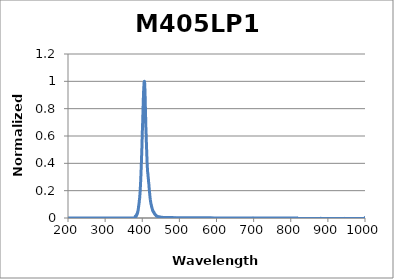
| Category | Normalized Intensity |
|---|---|
| 199.97546 | 0 |
| 200.17692 | 0 |
| 200.37839 | 0 |
| 200.57989 | 0 |
| 200.7814 | 0 |
| 200.98293 | 0 |
| 201.18448 | 0 |
| 201.38605 | 0 |
| 201.58764 | 0 |
| 201.78925 | 0 |
| 201.99087 | 0 |
| 202.19252 | 0 |
| 202.39418 | 0 |
| 202.59586 | 0 |
| 202.79756 | 0 |
| 202.99928 | 0 |
| 203.20102 | 0 |
| 203.40278 | 0 |
| 203.60455 | 0 |
| 203.80635 | 0 |
| 204.00816 | 0 |
| 204.20999 | 0 |
| 204.41184 | 0 |
| 204.61371 | 0 |
| 204.8156 | 0 |
| 205.0175 | 0 |
| 205.21943 | 0 |
| 205.42137 | 0 |
| 205.62334 | 0 |
| 205.82532 | 0 |
| 206.02732 | 0 |
| 206.22934 | 0 |
| 206.43137 | 0 |
| 206.63343 | 0 |
| 206.83551 | 0 |
| 207.0376 | 0 |
| 207.23971 | 0 |
| 207.44184 | 0 |
| 207.64399 | 0 |
| 207.84616 | 0 |
| 208.04835 | 0 |
| 208.25055 | 0 |
| 208.45278 | 0 |
| 208.65502 | 0 |
| 208.85728 | 0 |
| 209.05956 | 0 |
| 209.26186 | 0 |
| 209.46418 | 0 |
| 209.66651 | 0 |
| 209.86887 | 0 |
| 210.07124 | 0 |
| 210.27363 | 0 |
| 210.47604 | 0 |
| 210.67847 | 0 |
| 210.88092 | 0 |
| 211.08338 | 0 |
| 211.28587 | 0 |
| 211.48837 | 0 |
| 211.69089 | 0 |
| 211.89343 | 0 |
| 212.09599 | 0 |
| 212.29857 | 0 |
| 212.50117 | 0 |
| 212.70378 | 0 |
| 212.90641 | 0 |
| 213.10907 | 0 |
| 213.31174 | 0 |
| 213.51442 | 0 |
| 213.71713 | 0 |
| 213.91986 | 0 |
| 214.1226 | 0 |
| 214.32537 | 0 |
| 214.52815 | 0 |
| 214.73095 | 0 |
| 214.93376 | 0 |
| 215.1366 | 0 |
| 215.33946 | 0 |
| 215.54233 | 0 |
| 215.74522 | 0 |
| 215.94813 | 0 |
| 216.15106 | 0 |
| 216.35401 | 0 |
| 216.55698 | 0 |
| 216.75996 | 0 |
| 216.96297 | 0 |
| 217.16599 | 0 |
| 217.36903 | 0 |
| 217.57209 | 0 |
| 217.77517 | 0 |
| 217.97826 | 0 |
| 218.18138 | 0 |
| 218.38451 | 0 |
| 218.58766 | 0 |
| 218.79083 | 0 |
| 218.99402 | 0 |
| 219.19722 | 0 |
| 219.40045 | 0 |
| 219.60369 | 0 |
| 219.80695 | 0 |
| 220.01023 | 0 |
| 220.21353 | 0 |
| 220.41685 | 0 |
| 220.62018 | 0 |
| 220.82354 | 0 |
| 221.02691 | 0 |
| 221.2303 | 0 |
| 221.43371 | 0 |
| 221.63713 | 0 |
| 221.84058 | 0 |
| 222.04404 | 0 |
| 222.24753 | 0 |
| 222.45103 | 0 |
| 222.65455 | 0 |
| 222.85808 | 0 |
| 223.06164 | 0 |
| 223.26521 | 0 |
| 223.46881 | 0 |
| 223.67242 | 0 |
| 223.87605 | 0 |
| 224.07969 | 0 |
| 224.28336 | 0 |
| 224.48704 | 0 |
| 224.69075 | 0 |
| 224.89447 | 0 |
| 225.0982 | 0 |
| 225.30196 | 0 |
| 225.50574 | 0 |
| 225.70953 | 0 |
| 225.91334 | 0 |
| 226.11717 | 0 |
| 226.32102 | 0 |
| 226.52489 | 0 |
| 226.72878 | 0 |
| 226.93268 | 0 |
| 227.1366 | 0 |
| 227.34054 | 0 |
| 227.5445 | 0 |
| 227.74848 | 0 |
| 227.95247 | 0 |
| 228.15649 | 0 |
| 228.36052 | 0 |
| 228.56457 | 0 |
| 228.76863 | 0 |
| 228.97272 | 0 |
| 229.17683 | 0 |
| 229.38095 | 0 |
| 229.58509 | 0 |
| 229.78925 | 0 |
| 229.99343 | 0 |
| 230.19762 | 0 |
| 230.40183 | 0 |
| 230.60607 | 0 |
| 230.81032 | 0 |
| 231.01459 | 0 |
| 231.21887 | 0 |
| 231.42318 | 0 |
| 231.6275 | 0 |
| 231.83184 | 0 |
| 232.0362 | 0 |
| 232.24058 | 0 |
| 232.44497 | 0 |
| 232.64939 | 0 |
| 232.85382 | 0 |
| 233.05827 | 0 |
| 233.26274 | 0 |
| 233.46722 | 0 |
| 233.67173 | 0 |
| 233.87625 | 0 |
| 234.08079 | 0 |
| 234.28535 | 0 |
| 234.48993 | 0 |
| 234.69452 | 0 |
| 234.89914 | 0 |
| 235.10377 | 0 |
| 235.30842 | 0 |
| 235.51309 | 0 |
| 235.71777 | 0 |
| 235.92248 | 0 |
| 236.1272 | 0 |
| 236.33194 | 0 |
| 236.5367 | 0 |
| 236.74147 | 0 |
| 236.94627 | 0 |
| 237.15108 | 0 |
| 237.35591 | 0 |
| 237.56076 | 0 |
| 237.76563 | 0 |
| 237.97051 | 0 |
| 238.17541 | 0 |
| 238.38033 | 0 |
| 238.58527 | 0 |
| 238.79023 | 0 |
| 238.9952 | 0 |
| 239.2002 | 0 |
| 239.40521 | 0 |
| 239.61024 | 0 |
| 239.81529 | 0 |
| 240.02035 | 0 |
| 240.22543 | 0 |
| 240.43053 | 0 |
| 240.63565 | 0 |
| 240.84079 | 0 |
| 241.04595 | 0 |
| 241.25112 | 0 |
| 241.45631 | 0 |
| 241.66152 | 0 |
| 241.86675 | 0 |
| 242.07199 | 0 |
| 242.27726 | 0 |
| 242.48254 | 0 |
| 242.68784 | 0 |
| 242.89315 | 0 |
| 243.09849 | 0 |
| 243.30384 | 0 |
| 243.50921 | 0 |
| 243.7146 | 0 |
| 243.92001 | 0 |
| 244.12543 | 0 |
| 244.33087 | 0 |
| 244.53633 | 0 |
| 244.74181 | 0 |
| 244.94731 | 0 |
| 245.15282 | 0 |
| 245.35836 | 0 |
| 245.56391 | 0 |
| 245.76948 | 0 |
| 245.97506 | 0 |
| 246.18067 | 0 |
| 246.38629 | 0 |
| 246.59193 | 0 |
| 246.79758 | 0 |
| 247.00326 | 0 |
| 247.20895 | 0 |
| 247.41466 | 0 |
| 247.62039 | 0 |
| 247.82614 | 0 |
| 248.03191 | 0 |
| 248.23769 | 0 |
| 248.44349 | 0 |
| 248.64931 | 0 |
| 248.85514 | 0 |
| 249.061 | 0 |
| 249.26687 | 0 |
| 249.47276 | 0 |
| 249.67867 | 0 |
| 249.88459 | 0 |
| 250.09054 | 0 |
| 250.2965 | 0 |
| 250.50248 | 0 |
| 250.70847 | 0 |
| 250.91449 | 0 |
| 251.12052 | 0 |
| 251.32657 | 0 |
| 251.53264 | 0 |
| 251.73872 | 0 |
| 251.94483 | 0 |
| 252.15095 | 0 |
| 252.35709 | 0 |
| 252.56325 | 0 |
| 252.76942 | 0 |
| 252.97561 | 0 |
| 253.18182 | 0 |
| 253.38805 | 0 |
| 253.5943 | 0 |
| 253.80056 | 0 |
| 254.00684 | 0 |
| 254.21314 | 0 |
| 254.41946 | 0 |
| 254.62579 | 0 |
| 254.83214 | 0 |
| 255.03851 | 0 |
| 255.2449 | 0 |
| 255.45131 | 0 |
| 255.65773 | 0 |
| 255.86417 | 0 |
| 256.07063 | 0 |
| 256.27711 | 0 |
| 256.4836 | 0 |
| 256.69011 | 0 |
| 256.89664 | 0 |
| 257.10319 | 0 |
| 257.30975 | 0 |
| 257.51634 | 0 |
| 257.72294 | 0 |
| 257.92955 | 0 |
| 258.13619 | 0 |
| 258.34284 | 0 |
| 258.54951 | 0 |
| 258.7562 | 0 |
| 258.96291 | 0 |
| 259.16963 | 0 |
| 259.37637 | 0 |
| 259.58313 | 0 |
| 259.78991 | 0 |
| 259.9967 | 0 |
| 260.20351 | 0 |
| 260.41034 | 0 |
| 260.61719 | 0 |
| 260.82406 | 0 |
| 261.03094 | 0 |
| 261.23784 | 0 |
| 261.44476 | 0 |
| 261.65169 | 0 |
| 261.85864 | 0 |
| 262.06561 | 0 |
| 262.2726 | 0 |
| 262.47961 | 0 |
| 262.68663 | 0 |
| 262.89367 | 0 |
| 263.10073 | 0 |
| 263.30781 | 0 |
| 263.5149 | 0 |
| 263.72201 | 0 |
| 263.92914 | 0 |
| 264.13629 | 0 |
| 264.34345 | 0 |
| 264.55063 | 0 |
| 264.75783 | 0 |
| 264.96505 | 0 |
| 265.17228 | 0 |
| 265.37953 | 0 |
| 265.5868 | 0 |
| 265.79409 | 0 |
| 266.00139 | 0 |
| 266.20871 | 0 |
| 266.41605 | 0 |
| 266.62341 | 0 |
| 266.83078 | 0 |
| 267.03817 | 0 |
| 267.24558 | 0 |
| 267.45301 | 0 |
| 267.66045 | 0 |
| 267.86791 | 0 |
| 268.07539 | 0 |
| 268.28289 | 0 |
| 268.4904 | 0 |
| 268.69793 | 0 |
| 268.90548 | 0 |
| 269.11305 | 0 |
| 269.32063 | 0 |
| 269.52823 | 0 |
| 269.73585 | 0 |
| 269.94349 | 0 |
| 270.15114 | 0 |
| 270.35881 | 0 |
| 270.5665 | 0 |
| 270.77421 | 0 |
| 270.98193 | 0 |
| 271.18967 | 0 |
| 271.39743 | 0 |
| 271.60521 | 0 |
| 271.813 | 0 |
| 272.02081 | 0 |
| 272.22864 | 0 |
| 272.43648 | 0 |
| 272.64434 | 0 |
| 272.85222 | 0 |
| 273.06012 | 0 |
| 273.26804 | 0 |
| 273.47597 | 0 |
| 273.68392 | 0 |
| 273.89188 | 0 |
| 274.09987 | 0 |
| 274.30787 | 0 |
| 274.51589 | 0 |
| 274.72392 | 0 |
| 274.93198 | 0 |
| 275.14005 | 0 |
| 275.34814 | 0 |
| 275.55624 | 0 |
| 275.76437 | 0 |
| 275.97251 | 0 |
| 276.18066 | 0 |
| 276.38884 | 0 |
| 276.59703 | 0 |
| 276.80524 | 0 |
| 277.01347 | 0 |
| 277.22171 | 0 |
| 277.42997 | 0 |
| 277.63825 | 0 |
| 277.84655 | 0 |
| 278.05486 | 0 |
| 278.26319 | 0 |
| 278.47154 | 0 |
| 278.6799 | 0 |
| 278.88829 | 0 |
| 279.09669 | 0 |
| 279.3051 | 0 |
| 279.51354 | 0 |
| 279.72199 | 0 |
| 279.93046 | 0 |
| 280.13894 | 0 |
| 280.34745 | 0 |
| 280.55597 | 0 |
| 280.7645 | 0 |
| 280.97306 | 0 |
| 281.18163 | 0 |
| 281.39022 | 0 |
| 281.59883 | 0 |
| 281.80745 | 0 |
| 282.01609 | 0 |
| 282.22475 | 0 |
| 282.43342 | 0 |
| 282.64212 | 0 |
| 282.85083 | 0 |
| 283.05955 | 0 |
| 283.2683 | 0 |
| 283.47706 | 0 |
| 283.68584 | 0 |
| 283.89463 | 0 |
| 284.10345 | 0 |
| 284.31228 | 0 |
| 284.52112 | 0 |
| 284.72999 | 0 |
| 284.93887 | 0 |
| 285.14777 | 0 |
| 285.35668 | 0 |
| 285.56562 | 0 |
| 285.77457 | 0 |
| 285.98353 | 0 |
| 286.19252 | 0 |
| 286.40152 | 0 |
| 286.61054 | 0 |
| 286.81957 | 0 |
| 287.02863 | 0 |
| 287.2377 | 0 |
| 287.44678 | 0 |
| 287.65589 | 0 |
| 287.86501 | 0 |
| 288.07415 | 0 |
| 288.2833 | 0 |
| 288.49248 | 0 |
| 288.70167 | 0 |
| 288.91087 | 0 |
| 289.1201 | 0 |
| 289.32934 | 0 |
| 289.53859 | 0 |
| 289.74787 | 0 |
| 289.95716 | 0 |
| 290.16647 | 0 |
| 290.3758 | 0 |
| 290.58514 | 0 |
| 290.7945 | 0 |
| 291.00388 | 0 |
| 291.21327 | 0 |
| 291.42268 | 0 |
| 291.63211 | 0 |
| 291.84156 | 0 |
| 292.05102 | 0 |
| 292.2605 | 0 |
| 292.47 | 0 |
| 292.67951 | 0 |
| 292.88904 | 0 |
| 293.09859 | 0 |
| 293.30815 | 0 |
| 293.51773 | 0 |
| 293.72733 | 0 |
| 293.93695 | 0 |
| 294.14658 | 0 |
| 294.35623 | 0 |
| 294.56589 | 0 |
| 294.77558 | 0 |
| 294.98528 | 0 |
| 295.195 | 0 |
| 295.40473 | 0 |
| 295.61448 | 0 |
| 295.82425 | 0 |
| 296.03403 | 0 |
| 296.24384 | 0 |
| 296.45366 | 0 |
| 296.66349 | 0 |
| 296.87334 | 0 |
| 297.08321 | 0 |
| 297.2931 | 0 |
| 297.503 | 0 |
| 297.71292 | 0 |
| 297.92286 | 0 |
| 298.13282 | 0 |
| 298.34279 | 0 |
| 298.55277 | 0 |
| 298.76278 | 0 |
| 298.9728 | 0 |
| 299.18284 | 0 |
| 299.3929 | 0 |
| 299.60297 | 0 |
| 299.81306 | 0 |
| 300.02316 | 0 |
| 300.23329 | 0 |
| 300.44343 | 0 |
| 300.65358 | 0 |
| 300.86376 | 0 |
| 301.07395 | 0 |
| 301.28416 | 0 |
| 301.49438 | 0 |
| 301.70462 | 0 |
| 301.91488 | 0 |
| 302.12515 | 0 |
| 302.33544 | 0 |
| 302.54575 | 0 |
| 302.75608 | 0 |
| 302.96642 | 0 |
| 303.17678 | 0 |
| 303.38715 | 0 |
| 303.59755 | 0 |
| 303.80796 | 0 |
| 304.01838 | 0 |
| 304.22882 | 0 |
| 304.43928 | 0 |
| 304.64976 | 0 |
| 304.86025 | 0 |
| 305.07076 | 0 |
| 305.28129 | 0 |
| 305.49183 | 0 |
| 305.70239 | 0 |
| 305.91297 | 0 |
| 306.12356 | 0 |
| 306.33417 | 0 |
| 306.5448 | 0 |
| 306.75545 | 0 |
| 306.96611 | 0 |
| 307.17678 | 0 |
| 307.38748 | 0 |
| 307.59819 | 0 |
| 307.80892 | 0 |
| 308.01966 | 0 |
| 308.23042 | 0 |
| 308.4412 | 0 |
| 308.65199 | 0 |
| 308.8628 | 0 |
| 309.07363 | 0 |
| 309.28448 | 0 |
| 309.49534 | 0 |
| 309.70622 | 0 |
| 309.91711 | 0 |
| 310.12802 | 0 |
| 310.33895 | 0 |
| 310.54989 | 0 |
| 310.76085 | 0 |
| 310.97183 | 0 |
| 311.18283 | 0 |
| 311.39384 | 0 |
| 311.60487 | 0 |
| 311.81591 | 0 |
| 312.02697 | 0 |
| 312.23805 | 0 |
| 312.44914 | 0 |
| 312.66025 | 0 |
| 312.87138 | 0 |
| 313.08253 | 0 |
| 313.29369 | 0 |
| 313.50486 | 0 |
| 313.71606 | 0 |
| 313.92727 | 0 |
| 314.1385 | 0 |
| 314.34974 | 0 |
| 314.561 | 0 |
| 314.77228 | 0 |
| 314.98357 | 0 |
| 315.19488 | 0 |
| 315.40621 | 0 |
| 315.61755 | 0 |
| 315.82891 | 0 |
| 316.04029 | 0 |
| 316.25168 | 0 |
| 316.46309 | 0 |
| 316.67452 | 0 |
| 316.88596 | 0 |
| 317.09742 | 0 |
| 317.3089 | 0 |
| 317.52039 | 0 |
| 317.7319 | 0 |
| 317.94342 | 0 |
| 318.15496 | 0 |
| 318.36652 | 0 |
| 318.5781 | 0 |
| 318.78969 | 0 |
| 319.0013 | 0 |
| 319.21292 | 0 |
| 319.42456 | 0 |
| 319.63622 | 0 |
| 319.84789 | 0 |
| 320.05958 | 0 |
| 320.27129 | 0 |
| 320.48302 | 0 |
| 320.69476 | 0 |
| 320.90651 | 0 |
| 321.11828 | 0 |
| 321.33007 | 0 |
| 321.54188 | 0 |
| 321.7537 | 0 |
| 321.96554 | 0 |
| 322.1774 | 0 |
| 322.38927 | 0 |
| 322.60116 | 0 |
| 322.81306 | 0 |
| 323.02498 | 0 |
| 323.23692 | 0 |
| 323.44887 | 0 |
| 323.66084 | 0 |
| 323.87283 | 0 |
| 324.08483 | 0 |
| 324.29685 | 0 |
| 324.50889 | 0 |
| 324.72094 | 0 |
| 324.93301 | 0 |
| 325.14509 | 0 |
| 325.35719 | 0 |
| 325.56931 | 0 |
| 325.78145 | 0 |
| 325.9936 | 0 |
| 326.20576 | 0 |
| 326.41795 | 0 |
| 326.63015 | 0 |
| 326.84236 | 0 |
| 327.0546 | 0 |
| 327.26684 | 0 |
| 327.47911 | 0 |
| 327.69139 | 0 |
| 327.90369 | 0 |
| 328.116 | 0 |
| 328.32833 | 0 |
| 328.54068 | 0 |
| 328.75304 | 0 |
| 328.96542 | 0 |
| 329.17782 | 0 |
| 329.39023 | 0 |
| 329.60266 | 0 |
| 329.8151 | 0 |
| 330.02756 | 0 |
| 330.24004 | 0 |
| 330.45253 | 0 |
| 330.66504 | 0 |
| 330.87757 | 0 |
| 331.09011 | 0 |
| 331.30267 | 0 |
| 331.51525 | 0 |
| 331.72784 | 0 |
| 331.94045 | 0 |
| 332.15307 | 0 |
| 332.36571 | 0 |
| 332.57837 | 0 |
| 332.79104 | 0 |
| 333.00373 | 0 |
| 333.21643 | 0 |
| 333.42915 | 0 |
| 333.64189 | 0 |
| 333.85464 | 0 |
| 334.06741 | 0 |
| 334.2802 | 0 |
| 334.493 | 0 |
| 334.70582 | 0 |
| 334.91866 | 0 |
| 335.13151 | 0 |
| 335.34437 | 0 |
| 335.55726 | 0 |
| 335.77016 | 0 |
| 335.98307 | 0 |
| 336.196 | 0 |
| 336.40895 | 0 |
| 336.62192 | 0 |
| 336.8349 | 0 |
| 337.04789 | 0 |
| 337.26091 | 0 |
| 337.47394 | 0 |
| 337.68698 | 0 |
| 337.90004 | 0 |
| 338.11312 | 0 |
| 338.32621 | 0 |
| 338.53932 | 0 |
| 338.75245 | 0 |
| 338.96559 | 0 |
| 339.17875 | 0 |
| 339.39192 | 0 |
| 339.60511 | 0 |
| 339.81832 | 0 |
| 340.03154 | 0 |
| 340.24478 | 0 |
| 340.45804 | 0 |
| 340.67131 | 0 |
| 340.88459 | 0 |
| 341.0979 | 0 |
| 341.31122 | 0 |
| 341.52455 | 0 |
| 341.7379 | 0 |
| 341.95127 | 0 |
| 342.16465 | 0 |
| 342.37805 | 0 |
| 342.59147 | 0 |
| 342.8049 | 0 |
| 343.01835 | 0 |
| 343.23181 | 0 |
| 343.44529 | 0 |
| 343.65879 | 0 |
| 343.8723 | 0 |
| 344.08583 | 0 |
| 344.29937 | 0 |
| 344.51293 | 0 |
| 344.72651 | 0 |
| 344.9401 | 0 |
| 345.15371 | 0 |
| 345.36733 | 0 |
| 345.58097 | 0 |
| 345.79463 | 0 |
| 346.0083 | 0 |
| 346.22199 | 0 |
| 346.43569 | 0 |
| 346.64941 | 0 |
| 346.86315 | 0 |
| 347.0769 | 0 |
| 347.29067 | 0 |
| 347.50446 | 0 |
| 347.71826 | 0 |
| 347.93207 | 0 |
| 348.1459 | 0 |
| 348.35975 | 0 |
| 348.57362 | 0 |
| 348.78749 | 0 |
| 349.00139 | 0 |
| 349.2153 | 0 |
| 349.42923 | 0 |
| 349.64317 | 0 |
| 349.85713 | 0 |
| 350.07111 | 0 |
| 350.2851 | 0 |
| 350.49911 | 0 |
| 350.71313 | 0 |
| 350.92717 | 0 |
| 351.14122 | 0 |
| 351.3553 | 0 |
| 351.56938 | 0 |
| 351.78349 | 0 |
| 351.9976 | 0 |
| 352.21174 | 0 |
| 352.42589 | 0 |
| 352.64005 | 0 |
| 352.85424 | 0 |
| 353.06844 | 0 |
| 353.28265 | 0 |
| 353.49688 | 0 |
| 353.71112 | 0 |
| 353.92539 | 0 |
| 354.13966 | 0 |
| 354.35396 | 0 |
| 354.56827 | 0 |
| 354.78259 | 0 |
| 354.99693 | 0 |
| 355.21129 | 0 |
| 355.42566 | 0 |
| 355.64005 | 0 |
| 355.85445 | 0 |
| 356.06887 | 0 |
| 356.28331 | 0 |
| 356.49776 | 0 |
| 356.71223 | 0 |
| 356.92671 | 0 |
| 357.14121 | 0 |
| 357.35572 | 0 |
| 357.57025 | 0 |
| 357.7848 | 0 |
| 357.99936 | 0 |
| 358.21394 | 0 |
| 358.42853 | 0 |
| 358.64314 | 0 |
| 358.85777 | 0 |
| 359.07241 | 0 |
| 359.28706 | 0 |
| 359.50173 | 0 |
| 359.71642 | 0 |
| 359.93113 | 0 |
| 360.14585 | 0 |
| 360.36058 | 0 |
| 360.57533 | 0 |
| 360.7901 | 0 |
| 361.00488 | 0 |
| 361.21968 | 0 |
| 361.43449 | 0 |
| 361.64932 | 0 |
| 361.86417 | 0 |
| 362.07903 | 0 |
| 362.29391 | 0 |
| 362.5088 | 0 |
| 362.72371 | 0 |
| 362.93863 | 0 |
| 363.15357 | 0 |
| 363.36852 | 0 |
| 363.58349 | 0 |
| 363.79848 | 0 |
| 364.01348 | 0 |
| 364.2285 | 0 |
| 364.44353 | 0 |
| 364.65858 | 0 |
| 364.87365 | 0 |
| 365.08873 | 0 |
| 365.30382 | 0 |
| 365.51894 | 0 |
| 365.73406 | 0 |
| 365.94921 | 0 |
| 366.16436 | 0 |
| 366.37954 | 0 |
| 366.59473 | 0 |
| 366.80993 | 0 |
| 367.02515 | 0 |
| 367.24039 | 0 |
| 367.45564 | 0 |
| 367.67091 | 0 |
| 367.88619 | 0 |
| 368.10149 | 0 |
| 368.31681 | 0 |
| 368.53214 | 0 |
| 368.74748 | 0 |
| 368.96285 | 0 |
| 369.17822 | 0 |
| 369.39361 | 0 |
| 369.60902 | 0 |
| 369.82445 | 0 |
| 370.03989 | 0 |
| 370.25534 | 0 |
| 370.47081 | 0 |
| 370.6863 | 0 |
| 370.9018 | 0 |
| 371.11731 | 0 |
| 371.33285 | 0 |
| 371.54839 | 0 |
| 371.76396 | 0 |
| 371.97954 | 0 |
| 372.19513 | 0 |
| 372.41074 | 0 |
| 372.62637 | 0 |
| 372.84201 | 0 |
| 373.05766 | 0 |
| 373.27334 | 0 |
| 373.48902 | 0 |
| 373.70473 | 0 |
| 373.92044 | 0 |
| 374.13618 | 0 |
| 374.35193 | 0 |
| 374.56769 | 0 |
| 374.78347 | 0 |
| 374.99927 | 0 |
| 375.21508 | 0 |
| 375.43091 | 0 |
| 375.64675 | 0 |
| 375.86261 | 0 |
| 376.07848 | 0 |
| 376.29437 | 0 |
| 376.51027 | 0 |
| 376.72619 | 0 |
| 376.94213 | 0 |
| 377.15808 | 0 |
| 377.37404 | 0 |
| 377.59002 | 0 |
| 377.80602 | 0 |
| 378.02203 | 0 |
| 378.23806 | 0 |
| 378.4541 | 0 |
| 378.67016 | 0 |
| 378.88623 | 0 |
| 379.10232 | 0 |
| 379.31842 | 0 |
| 379.53454 | 0 |
| 379.75068 | 0 |
| 379.96683 | 0 |
| 380.183 | 0 |
| 380.39918 | 0 |
| 380.61537 | 0 |
| 380.83158 | 0 |
| 381.04781 | 0.012 |
| 381.26405 | 0.004 |
| 381.48031 | 0.012 |
| 381.69659 | 0.005 |
| 381.91287 | 0.014 |
| 382.12918 | 0.007 |
| 382.3455 | 0.015 |
| 382.56183 | 0.009 |
| 382.77818 | 0.016 |
| 382.99455 | 0.01 |
| 383.21093 | 0.016 |
| 383.42732 | 0.012 |
| 383.64373 | 0.018 |
| 383.86016 | 0.013 |
| 384.0766 | 0.021 |
| 384.29306 | 0.016 |
| 384.50953 | 0.023 |
| 384.72602 | 0.019 |
| 384.94252 | 0.025 |
| 385.15904 | 0.02 |
| 385.37557 | 0.028 |
| 385.59212 | 0.024 |
| 385.80868 | 0.032 |
| 386.02526 | 0.027 |
| 386.24186 | 0.033 |
| 386.45847 | 0.031 |
| 386.67509 | 0.036 |
| 386.89173 | 0.032 |
| 387.10839 | 0.039 |
| 387.32506 | 0.037 |
| 387.54174 | 0.045 |
| 387.75844 | 0.041 |
| 387.97516 | 0.048 |
| 388.19189 | 0.046 |
| 388.40864 | 0.054 |
| 388.6254 | 0.051 |
| 388.84218 | 0.059 |
| 389.05897 | 0.058 |
| 389.27578 | 0.068 |
| 389.4926 | 0.067 |
| 389.70944 | 0.078 |
| 389.92629 | 0.077 |
| 390.14316 | 0.085 |
| 390.36004 | 0.085 |
| 390.57694 | 0.094 |
| 390.79385 | 0.093 |
| 391.01078 | 0.102 |
| 391.22773 | 0.1 |
| 391.44469 | 0.111 |
| 391.66166 | 0.112 |
| 391.87865 | 0.123 |
| 392.09566 | 0.123 |
| 392.31268 | 0.133 |
| 392.52971 | 0.133 |
| 392.74676 | 0.143 |
| 392.96383 | 0.144 |
| 393.18091 | 0.154 |
| 393.398 | 0.157 |
| 393.61511 | 0.169 |
| 393.83224 | 0.172 |
| 394.04938 | 0.185 |
| 394.26653 | 0.191 |
| 394.48371 | 0.207 |
| 394.70089 | 0.211 |
| 394.91809 | 0.226 |
| 395.13531 | 0.233 |
| 395.35254 | 0.25 |
| 395.56979 | 0.258 |
| 395.78705 | 0.275 |
| 396.00433 | 0.285 |
| 396.22162 | 0.302 |
| 396.43892 | 0.313 |
| 396.65625 | 0.332 |
| 396.87358 | 0.344 |
| 397.09094 | 0.363 |
| 397.3083 | 0.376 |
| 397.52568 | 0.397 |
| 397.74308 | 0.408 |
| 397.96049 | 0.429 |
| 398.17792 | 0.44 |
| 398.39536 | 0.464 |
| 398.61282 | 0.476 |
| 398.83029 | 0.497 |
| 399.04778 | 0.513 |
| 399.26528 | 0.538 |
| 399.4828 | 0.554 |
| 399.70033 | 0.579 |
| 399.91788 | 0.595 |
| 400.13544 | 0.621 |
| 400.35302 | 0.641 |
| 400.57061 | 0.661 |
| 400.78822 | 0.675 |
| 401.00584 | 0.691 |
| 401.22348 | 0.713 |
| 401.44113 | 0.733 |
| 401.6588 | 0.751 |
| 401.87648 | 0.779 |
| 402.09418 | 0.803 |
| 402.31189 | 0.816 |
| 402.52962 | 0.83 |
| 402.74736 | 0.848 |
| 402.96512 | 0.872 |
| 403.18289 | 0.894 |
| 403.40067 | 0.901 |
| 403.61848 | 0.925 |
| 403.83629 | 0.936 |
| 404.05412 | 0.956 |
| 404.27197 | 0.96 |
| 404.48983 | 0.967 |
| 404.70771 | 0.986 |
| 404.9256 | 0.988 |
| 405.14351 | 0.979 |
| 405.36143 | 0.986 |
| 405.57936 | 0.996 |
| 405.79731 | 1 |
| 406.01528 | 0.991 |
| 406.23326 | 0.99 |
| 406.45126 | 0.985 |
| 406.66927 | 0.985 |
| 406.88729 | 0.96 |
| 407.10533 | 0.945 |
| 407.32339 | 0.922 |
| 407.54146 | 0.914 |
| 407.75954 | 0.889 |
| 407.97764 | 0.866 |
| 408.19576 | 0.845 |
| 408.41389 | 0.815 |
| 408.63203 | 0.797 |
| 408.85019 | 0.765 |
| 409.06836 | 0.743 |
| 409.28655 | 0.722 |
| 409.50476 | 0.698 |
| 409.72297 | 0.668 |
| 409.94121 | 0.652 |
| 410.15946 | 0.635 |
| 410.37772 | 0.621 |
| 410.596 | 0.603 |
| 410.81429 | 0.585 |
| 411.0326 | 0.558 |
| 411.25092 | 0.548 |
| 411.46925 | 0.531 |
| 411.68761 | 0.513 |
| 411.90597 | 0.488 |
| 412.12435 | 0.478 |
| 412.34275 | 0.46 |
| 412.56116 | 0.442 |
| 412.77959 | 0.422 |
| 412.99803 | 0.414 |
| 413.21648 | 0.398 |
| 413.43495 | 0.39 |
| 413.65344 | 0.374 |
| 413.87193 | 0.365 |
| 414.09045 | 0.356 |
| 414.30898 | 0.351 |
| 414.52752 | 0.336 |
| 414.74608 | 0.331 |
| 414.96465 | 0.324 |
| 415.18324 | 0.324 |
| 415.40184 | 0.31 |
| 415.62046 | 0.307 |
| 415.83909 | 0.302 |
| 416.05774 | 0.299 |
| 416.2764 | 0.287 |
| 416.49508 | 0.287 |
| 416.71377 | 0.278 |
| 416.93247 | 0.276 |
| 417.15119 | 0.264 |
| 417.36993 | 0.258 |
| 417.58868 | 0.249 |
| 417.80744 | 0.249 |
| 418.02622 | 0.236 |
| 418.24501 | 0.235 |
| 418.46382 | 0.224 |
| 418.68264 | 0.221 |
| 418.90148 | 0.21 |
| 419.12033 | 0.205 |
| 419.3392 | 0.197 |
| 419.55808 | 0.195 |
| 419.77698 | 0.183 |
| 419.99589 | 0.179 |
| 420.21481 | 0.17 |
| 420.43375 | 0.167 |
| 420.65271 | 0.158 |
| 420.87167 | 0.155 |
| 421.09066 | 0.146 |
| 421.30966 | 0.145 |
| 421.52867 | 0.136 |
| 421.7477 | 0.136 |
| 421.96674 | 0.129 |
| 422.1858 | 0.127 |
| 422.40487 | 0.12 |
| 422.62395 | 0.119 |
| 422.84305 | 0.113 |
| 423.06217 | 0.112 |
| 423.2813 | 0.106 |
| 423.50044 | 0.105 |
| 423.7196 | 0.099 |
| 423.93878 | 0.1 |
| 424.15796 | 0.096 |
| 424.37717 | 0.097 |
| 424.59638 | 0.091 |
| 424.81561 | 0.09 |
| 425.03486 | 0.084 |
| 425.25412 | 0.085 |
| 425.4734 | 0.08 |
| 425.69269 | 0.08 |
| 425.91199 | 0.074 |
| 426.13131 | 0.075 |
| 426.35064 | 0.071 |
| 426.56999 | 0.073 |
| 426.78935 | 0.067 |
| 427.00873 | 0.067 |
| 427.22812 | 0.063 |
| 427.44753 | 0.063 |
| 427.66695 | 0.057 |
| 427.88638 | 0.059 |
| 428.10583 | 0.054 |
| 428.3253 | 0.056 |
| 428.54477 | 0.051 |
| 428.76427 | 0.053 |
| 428.98377 | 0.05 |
| 429.2033 | 0.051 |
| 429.42283 | 0.047 |
| 429.64238 | 0.048 |
| 429.86195 | 0.045 |
| 430.08153 | 0.047 |
| 430.30112 | 0.043 |
| 430.52073 | 0.045 |
| 430.74035 | 0.042 |
| 430.95999 | 0.044 |
| 431.17964 | 0.04 |
| 431.39931 | 0.042 |
| 431.61899 | 0.039 |
| 431.83868 | 0.039 |
| 432.05839 | 0.035 |
| 432.27812 | 0.036 |
| 432.49785 | 0.033 |
| 432.71761 | 0.035 |
| 432.93737 | 0.031 |
| 433.15716 | 0.033 |
| 433.37695 | 0.03 |
| 433.59676 | 0.032 |
| 433.81659 | 0.028 |
| 434.03643 | 0.029 |
| 434.25628 | 0.026 |
| 434.47615 | 0.027 |
| 434.69603 | 0.024 |
| 434.91593 | 0.026 |
| 435.13584 | 0.023 |
| 435.35576 | 0.025 |
| 435.5757 | 0.022 |
| 435.79565 | 0.023 |
| 436.01562 | 0.02 |
| 436.23561 | 0.022 |
| 436.4556 | 0.019 |
| 436.67561 | 0.02 |
| 436.89564 | 0.018 |
| 437.11568 | 0.019 |
| 437.33573 | 0.016 |
| 437.5558 | 0.018 |
| 437.77589 | 0.016 |
| 437.99598 | 0.018 |
| 438.21609 | 0.015 |
| 438.43622 | 0.017 |
| 438.65636 | 0.014 |
| 438.87651 | 0.016 |
| 439.09668 | 0.013 |
| 439.31687 | 0.015 |
| 439.53706 | 0.012 |
| 439.75727 | 0.014 |
| 439.9775 | 0.012 |
| 440.19774 | 0.013 |
| 440.41799 | 0.011 |
| 440.63826 | 0.013 |
| 440.85855 | 0.011 |
| 441.07884 | 0.012 |
| 441.29915 | 0.01 |
| 441.51948 | 0.012 |
| 441.73982 | 0.009 |
| 441.96017 | 0.011 |
| 442.18054 | 0.009 |
| 442.40092 | 0.011 |
| 442.62132 | 0.009 |
| 442.84173 | 0.01 |
| 443.06216 | 0.008 |
| 443.2826 | 0.01 |
| 443.50305 | 0.008 |
| 443.72352 | 0.009 |
| 443.944 | 0.007 |
| 444.1645 | 0.009 |
| 444.38501 | 0.007 |
| 444.60553 | 0.008 |
| 444.82607 | 0.007 |
| 445.04662 | 0.008 |
| 445.26719 | 0.006 |
| 445.48777 | 0.008 |
| 445.70837 | 0.006 |
| 445.92898 | 0.008 |
| 446.1496 | 0.006 |
| 446.37024 | 0.008 |
| 446.59089 | 0.006 |
| 446.81156 | 0.008 |
| 447.03224 | 0.005 |
| 447.25293 | 0.007 |
| 447.47364 | 0.005 |
| 447.69436 | 0.007 |
| 447.9151 | 0.005 |
| 448.13585 | 0.007 |
| 448.35662 | 0.005 |
| 448.5774 | 0.007 |
| 448.79819 | 0.005 |
| 449.019 | 0.007 |
| 449.23982 | 0.004 |
| 449.46065 | 0.006 |
| 449.6815 | 0.004 |
| 449.90237 | 0.006 |
| 450.12325 | 0.004 |
| 450.34414 | 0.006 |
| 450.56504 | 0.003 |
| 450.78597 | 0.006 |
| 451.0069 | 0.004 |
| 451.22785 | 0.006 |
| 451.44881 | 0.004 |
| 451.66979 | 0.006 |
| 451.89078 | 0.004 |
| 452.11178 | 0.005 |
| 452.3328 | 0.003 |
| 452.55383 | 0.005 |
| 452.77488 | 0.003 |
| 452.99594 | 0.005 |
| 453.21702 | 0.003 |
| 453.43811 | 0.005 |
| 453.65921 | 0.003 |
| 453.88032 | 0.005 |
| 454.10146 | 0.003 |
| 454.3226 | 0.005 |
| 454.54376 | 0.003 |
| 454.76493 | 0.005 |
| 454.98612 | 0.002 |
| 455.20732 | 0.004 |
| 455.42854 | 0.003 |
| 455.64976 | 0.004 |
| 455.87101 | 0.002 |
| 456.09226 | 0.004 |
| 456.31354 | 0.002 |
| 456.53482 | 0.004 |
| 456.75612 | 0.002 |
| 456.97743 | 0.004 |
| 457.19876 | 0.002 |
| 457.4201 | 0.004 |
| 457.64145 | 0.002 |
| 457.86282 | 0.004 |
| 458.08421 | 0.002 |
| 458.3056 | 0.004 |
| 458.52701 | 0.002 |
| 458.74844 | 0.004 |
| 458.96988 | 0.002 |
| 459.19133 | 0.004 |
| 459.41279 | 0.002 |
| 459.63427 | 0.004 |
| 459.85577 | 0.002 |
| 460.07728 | 0.004 |
| 460.2988 | 0.002 |
| 460.52033 | 0.004 |
| 460.74188 | 0.002 |
| 460.96345 | 0.004 |
| 461.18502 | 0.002 |
| 461.40662 | 0.004 |
| 461.62822 | 0.002 |
| 461.84984 | 0.004 |
| 462.07147 | 0.002 |
| 462.29312 | 0.004 |
| 462.51478 | 0.002 |
| 462.73645 | 0.004 |
| 462.95814 | 0.002 |
| 463.17984 | 0.004 |
| 463.40156 | 0.002 |
| 463.62329 | 0.004 |
| 463.84503 | 0.002 |
| 464.06679 | 0.003 |
| 464.28856 | 0.002 |
| 464.51035 | 0.003 |
| 464.73215 | 0.003 |
| 464.95396 | 0.002 |
| 465.17579 | 0.003 |
| 465.39763 | 0.002 |
| 465.61948 | 0.003 |
| 465.84135 | 0.002 |
| 466.06323 | 0.003 |
| 466.28513 | 0.001 |
| 466.50704 | 0.003 |
| 466.72896 | 0.002 |
| 466.9509 | 0.003 |
| 467.17285 | 0.002 |
| 467.39481 | 0.003 |
| 467.61679 | 0.002 |
| 467.83878 | 0.003 |
| 468.06079 | 0.002 |
| 468.28281 | 0.003 |
| 468.50484 | 0.002 |
| 468.72689 | 0.003 |
| 468.94895 | 0.002 |
| 469.17103 | 0.003 |
| 469.39312 | 0.002 |
| 469.61522 | 0.003 |
| 469.83733 | 0.002 |
| 470.05946 | 0.003 |
| 470.28161 | 0.002 |
| 470.50376 | 0.003 |
| 470.72594 | 0.002 |
| 470.94812 | 0.003 |
| 471.17032 | 0.002 |
| 471.39253 | 0.003 |
| 471.61476 | 0.002 |
| 471.837 | 0.003 |
| 472.05925 | 0.002 |
| 472.28152 | 0.003 |
| 472.5038 | 0.002 |
| 472.72609 | 0.003 |
| 472.9484 | 0.002 |
| 473.17072 | 0.003 |
| 473.39305 | 0.001 |
| 473.6154 | 0.003 |
| 473.83777 | 0.002 |
| 474.06014 | 0.003 |
| 474.28253 | 0.002 |
| 474.50494 | 0.003 |
| 474.72735 | 0.002 |
| 474.94978 | 0.003 |
| 475.17223 | 0.001 |
| 475.39469 | 0.003 |
| 475.61716 | 0.002 |
| 475.83964 | 0.003 |
| 476.06214 | 0.002 |
| 476.28465 | 0.003 |
| 476.50718 | 0.002 |
| 476.72972 | 0.003 |
| 476.95227 | 0.001 |
| 477.17484 | 0.003 |
| 477.39742 | 0.001 |
| 477.62001 | 0.003 |
| 477.84262 | 0.002 |
| 478.06524 | 0.003 |
| 478.28788 | 0.001 |
| 478.51053 | 0.003 |
| 478.73319 | 0.001 |
| 478.95586 | 0.003 |
| 479.17855 | 0.001 |
| 479.40126 | 0.003 |
| 479.62397 | 0.001 |
| 479.8467 | 0.003 |
| 480.06945 | 0.001 |
| 480.2922 | 0.003 |
| 480.51497 | 0.002 |
| 480.73776 | 0.003 |
| 480.96056 | 0.001 |
| 481.18337 | 0.003 |
| 481.40619 | 0.001 |
| 481.62903 | 0.003 |
| 481.85188 | 0.001 |
| 482.07475 | 0.003 |
| 482.29763 | 0.001 |
| 482.52052 | 0.003 |
| 482.74342 | 0.001 |
| 482.96634 | 0.003 |
| 483.18928 | 0.001 |
| 483.41222 | 0.003 |
| 483.63518 | 0.001 |
| 483.85815 | 0.003 |
| 484.08114 | 0.001 |
| 484.30414 | 0.003 |
| 484.52715 | 0.001 |
| 484.75018 | 0.003 |
| 484.97322 | 0.001 |
| 485.19628 | 0.003 |
| 485.41934 | 0.001 |
| 485.64242 | 0.003 |
| 485.86552 | 0.001 |
| 486.08863 | 0.003 |
| 486.31175 | 0.001 |
| 486.53488 | 0.003 |
| 486.75803 | 0.001 |
| 486.98119 | 0.003 |
| 487.20437 | 0.001 |
| 487.42756 | 0.003 |
| 487.65076 | 0.001 |
| 487.87397 | 0.003 |
| 488.0972 | 0.001 |
| 488.32044 | 0.003 |
| 488.5437 | 0.001 |
| 488.76697 | 0.003 |
| 488.99025 | 0.001 |
| 489.21354 | 0.003 |
| 489.43685 | 0.001 |
| 489.66018 | 0.003 |
| 489.88351 | 0.001 |
| 490.10686 | 0.003 |
| 490.33022 | 0.001 |
| 490.5536 | 0.003 |
| 490.77699 | 0.001 |
| 491.00039 | 0.003 |
| 491.22381 | 0.001 |
| 491.44724 | 0.002 |
| 491.67068 | 0.001 |
| 491.89413 | 0.003 |
| 492.1176 | 0.001 |
| 492.34109 | 0.002 |
| 492.56458 | 0.001 |
| 492.78809 | 0.003 |
| 493.01161 | 0.001 |
| 493.23515 | 0.003 |
| 493.4587 | 0.001 |
| 493.68226 | 0.003 |
| 493.90584 | 0.001 |
| 494.12943 | 0.003 |
| 494.35303 | 0.001 |
| 494.57664 | 0.003 |
| 494.80027 | 0.001 |
| 495.02391 | 0.003 |
| 495.24757 | 0.001 |
| 495.47124 | 0.003 |
| 495.69492 | 0.001 |
| 495.91862 | 0.003 |
| 496.14232 | 0.001 |
| 496.36605 | 0.003 |
| 496.58978 | 0.001 |
| 496.81353 | 0.002 |
| 497.03729 | 0.001 |
| 497.26107 | 0.002 |
| 497.48485 | 0.001 |
| 497.70866 | 0.002 |
| 497.93247 | 0.001 |
| 498.1563 | 0.002 |
| 498.38014 | 0.001 |
| 498.60399 | 0.002 |
| 498.82786 | 0.001 |
| 499.05174 | 0.002 |
| 499.27564 | 0.001 |
| 499.49954 | 0.002 |
| 499.72346 | 0.001 |
| 499.9474 | 0.002 |
| 500.17134 | 0.001 |
| 500.3953 | 0.002 |
| 500.61928 | 0.001 |
| 500.84326 | 0.002 |
| 501.06726 | 0.001 |
| 501.29127 | 0.002 |
| 501.5153 | 0.001 |
| 501.73934 | 0.002 |
| 501.96339 | 0.001 |
| 502.18745 | 0.002 |
| 502.41153 | 0.001 |
| 502.63562 | 0.002 |
| 502.85973 | 0.001 |
| 503.08385 | 0.002 |
| 503.30798 | 0.001 |
| 503.53212 | 0.002 |
| 503.75628 | 0.001 |
| 503.98045 | 0.002 |
| 504.20463 | 0.001 |
| 504.42883 | 0.002 |
| 504.65304 | 0.001 |
| 504.87726 | 0.002 |
| 505.1015 | 0.001 |
| 505.32575 | 0.002 |
| 505.55001 | 0.001 |
| 505.77428 | 0.002 |
| 505.99857 | 0.001 |
| 506.22287 | 0.002 |
| 506.44719 | 0.001 |
| 506.67151 | 0.002 |
| 506.89585 | 0.001 |
| 507.12021 | 0.002 |
| 507.34457 | 0.001 |
| 507.56895 | 0.002 |
| 507.79335 | 0.001 |
| 508.01775 | 0.002 |
| 508.24217 | 0.001 |
| 508.4666 | 0.002 |
| 508.69105 | 0.001 |
| 508.91551 | 0.002 |
| 509.13998 | 0.001 |
| 509.36446 | 0.002 |
| 509.58896 | 0.001 |
| 509.81347 | 0.002 |
| 510.03799 | 0.001 |
| 510.26253 | 0.002 |
| 510.48708 | 0.001 |
| 510.71164 | 0.002 |
| 510.93621 | 0.001 |
| 511.1608 | 0.002 |
| 511.3854 | 0.001 |
| 511.61002 | 0.002 |
| 511.83464 | 0.001 |
| 512.05928 | 0.002 |
| 512.28394 | 0.001 |
| 512.5086 | 0.002 |
| 512.73328 | 0.001 |
| 512.95797 | 0.002 |
| 513.18268 | 0.001 |
| 513.4074 | 0.002 |
| 513.63213 | 0.001 |
| 513.85687 | 0.002 |
| 514.08163 | 0.001 |
| 514.3064 | 0.002 |
| 514.53118 | 0.001 |
| 514.75597 | 0.002 |
| 514.98078 | 0.001 |
| 515.2056 | 0.002 |
| 515.43044 | 0.001 |
| 515.65529 | 0.002 |
| 515.88015 | 0.001 |
| 516.10502 | 0.002 |
| 516.3299 | 0.001 |
| 516.5548 | 0.002 |
| 516.77972 | 0.001 |
| 517.00464 | 0.002 |
| 517.22958 | 0.001 |
| 517.45453 | 0.002 |
| 517.67949 | 0.001 |
| 517.90447 | 0.002 |
| 518.12946 | 0.001 |
| 518.35446 | 0.002 |
| 518.57947 | 0.001 |
| 518.8045 | 0.002 |
| 519.02954 | 0.001 |
| 519.25459 | 0.002 |
| 519.47966 | 0.001 |
| 519.70474 | 0.002 |
| 519.92983 | 0.001 |
| 520.15493 | 0.002 |
| 520.38005 | 0.001 |
| 520.60518 | 0.002 |
| 520.83033 | 0.001 |
| 521.05548 | 0.002 |
| 521.28065 | 0.001 |
| 521.50583 | 0.002 |
| 521.73103 | 0.001 |
| 521.95623 | 0.001 |
| 522.18145 | 0.002 |
| 522.40669 | 0.001 |
| 522.63193 | 0.002 |
| 522.85719 | 0.001 |
| 523.08246 | 0.002 |
| 523.30774 | 0.001 |
| 523.53304 | 0.002 |
| 523.75835 | 0.001 |
| 523.98367 | 0.002 |
| 524.20901 | 0.001 |
| 524.43436 | 0.002 |
| 524.65972 | 0.001 |
| 524.88509 | 0.002 |
| 525.11048 | 0.001 |
| 525.33587 | 0.002 |
| 525.56129 | 0.001 |
| 525.78671 | 0.002 |
| 526.01215 | 0.001 |
| 526.2376 | 0.002 |
| 526.46306 | 0.001 |
| 526.68853 | 0.002 |
| 526.91402 | 0.001 |
| 527.13952 | 0.002 |
| 527.36504 | 0.001 |
| 527.59056 | 0.002 |
| 527.8161 | 0.001 |
| 528.04165 | 0.002 |
| 528.26722 | 0.001 |
| 528.49279 | 0.002 |
| 528.71838 | 0.001 |
| 528.94398 | 0.002 |
| 529.1696 | 0.001 |
| 529.39523 | 0.002 |
| 529.62087 | 0.001 |
| 529.84652 | 0.002 |
| 530.07218 | 0.001 |
| 530.29786 | 0.002 |
| 530.52355 | 0.001 |
| 530.74926 | 0.002 |
| 530.97497 | 0 |
| 531.2007 | 0.002 |
| 531.42644 | 0.001 |
| 531.6522 | 0.002 |
| 531.87796 | 0.001 |
| 532.10374 | 0.002 |
| 532.32953 | 0.001 |
| 532.55534 | 0.002 |
| 532.78116 | 0.001 |
| 533.00698 | 0.002 |
| 533.23283 | 0.001 |
| 533.45868 | 0.002 |
| 533.68455 | 0.001 |
| 533.91043 | 0.002 |
| 534.13632 | 0.001 |
| 534.36223 | 0.002 |
| 534.58815 | 0.001 |
| 534.81408 | 0.002 |
| 535.04002 | 0.001 |
| 535.26597 | 0.002 |
| 535.49194 | 0.001 |
| 535.71792 | 0.002 |
| 535.94392 | 0.001 |
| 536.16992 | 0.002 |
| 536.39594 | 0.001 |
| 536.62197 | 0.002 |
| 536.84801 | 0.001 |
| 537.07407 | 0.002 |
| 537.30014 | 0.001 |
| 537.52622 | 0.002 |
| 537.75231 | 0.001 |
| 537.97842 | 0.002 |
| 538.20454 | 0.001 |
| 538.43067 | 0.002 |
| 538.65681 | 0.001 |
| 538.88297 | 0.002 |
| 539.10914 | 0.001 |
| 539.33532 | 0.002 |
| 539.56151 | 0.001 |
| 539.78772 | 0.002 |
| 540.01394 | 0.001 |
| 540.24017 | 0.001 |
| 540.46641 | 0.001 |
| 540.69267 | 0.002 |
| 540.91893 | 0.001 |
| 541.14522 | 0.001 |
| 541.37151 | 0.001 |
| 541.59781 | 0.002 |
| 541.82413 | 0.001 |
| 542.05046 | 0.001 |
| 542.27681 | 0.001 |
| 542.50316 | 0.001 |
| 542.72953 | 0.001 |
| 542.95591 | 0.002 |
| 543.1823 | 0.001 |
| 543.40871 | 0.001 |
| 543.63513 | 0.001 |
| 543.86156 | 0.002 |
| 544.088 | 0.001 |
| 544.31445 | 0.001 |
| 544.54092 | 0.001 |
| 544.7674 | 0.002 |
| 544.99389 | 0.001 |
| 545.2204 | 0.002 |
| 545.44691 | 0.001 |
| 545.67344 | 0.002 |
| 545.89999 | 0.001 |
| 546.12654 | 0.001 |
| 546.35311 | 0.001 |
| 546.57968 | 0.001 |
| 546.80628 | 0.001 |
| 547.03288 | 0.001 |
| 547.2595 | 0.001 |
| 547.48612 | 0.001 |
| 547.71276 | 0 |
| 547.93942 | 0.001 |
| 548.16608 | 0.001 |
| 548.39276 | 0.001 |
| 548.61945 | 0.001 |
| 548.84615 | 0.001 |
| 549.07287 | 0.001 |
| 549.29959 | 0.001 |
| 549.52633 | 0.001 |
| 549.75308 | 0.001 |
| 549.97985 | 0.001 |
| 550.20662 | 0.001 |
| 550.43341 | 0.001 |
| 550.66021 | 0.001 |
| 550.88703 | 0.001 |
| 551.11385 | 0.001 |
| 551.34069 | 0 |
| 551.56754 | 0.001 |
| 551.7944 | 0.001 |
| 552.02128 | 0.001 |
| 552.24816 | 0 |
| 552.47506 | 0.001 |
| 552.70197 | 0.001 |
| 552.9289 | 0.001 |
| 553.15583 | 0 |
| 553.38278 | 0.001 |
| 553.60974 | 0.001 |
| 553.83671 | 0.001 |
| 554.0637 | 0 |
| 554.29069 | 0.001 |
| 554.5177 | 0 |
| 554.74473 | 0.001 |
| 554.97176 | 0 |
| 555.1988 | 0.001 |
| 555.42586 | 0 |
| 555.65293 | 0.001 |
| 555.88002 | 0.001 |
| 556.10711 | 0.001 |
| 556.33422 | 0 |
| 556.56134 | 0.001 |
| 556.78847 | 0 |
| 557.01561 | 0.001 |
| 557.24277 | 0 |
| 557.46993 | 0.001 |
| 557.69711 | 0 |
| 557.92431 | 0.001 |
| 558.15151 | 0 |
| 558.37873 | 0.001 |
| 558.60596 | 0 |
| 558.8332 | 0.001 |
| 559.06045 | 0 |
| 559.28771 | 0.001 |
| 559.51499 | 0 |
| 559.74228 | 0.001 |
| 559.96958 | 0 |
| 560.1969 | 0.001 |
| 560.42422 | 0 |
| 560.65156 | 0.001 |
| 560.87891 | 0 |
| 561.10627 | 0.001 |
| 561.33365 | 0 |
| 561.56103 | 0.001 |
| 561.78843 | 0 |
| 562.01584 | 0.001 |
| 562.24326 | 0 |
| 562.4707 | 0.001 |
| 562.69815 | 0 |
| 562.9256 | 0.001 |
| 563.15308 | 0 |
| 563.38056 | 0.001 |
| 563.60805 | 0 |
| 563.83556 | 0.001 |
| 564.06308 | 0 |
| 564.29061 | 0.001 |
| 564.51815 | 0 |
| 564.74571 | 0.001 |
| 564.97328 | 0 |
| 565.20086 | 0.001 |
| 565.42845 | 0 |
| 565.65605 | 0.001 |
| 565.88367 | 0 |
| 566.11129 | 0.001 |
| 566.33893 | 0 |
| 566.56659 | 0.001 |
| 566.79425 | 0 |
| 567.02192 | 0.001 |
| 567.24961 | 0 |
| 567.47731 | 0.001 |
| 567.70502 | 0 |
| 567.93275 | 0.001 |
| 568.16048 | 0 |
| 568.38823 | 0.001 |
| 568.61599 | 0 |
| 568.84376 | 0.001 |
| 569.07155 | 0 |
| 569.29934 | 0.001 |
| 569.52715 | 0 |
| 569.75497 | 0.001 |
| 569.9828 | 0 |
| 570.21064 | 0.001 |
| 570.4385 | 0 |
| 570.66636 | 0.001 |
| 570.89424 | 0 |
| 571.12213 | 0.001 |
| 571.35004 | 0 |
| 571.57795 | 0.001 |
| 571.80588 | 0 |
| 572.03382 | 0.001 |
| 572.26177 | 0 |
| 572.48973 | 0.001 |
| 572.71771 | 0 |
| 572.94569 | 0.001 |
| 573.17369 | 0 |
| 573.4017 | 0.001 |
| 573.62972 | 0 |
| 573.85776 | 0.001 |
| 574.0858 | 0 |
| 574.31386 | 0.001 |
| 574.54193 | 0 |
| 574.77001 | 0.001 |
| 574.99811 | 0 |
| 575.22621 | 0.001 |
| 575.45433 | 0 |
| 575.68246 | 0.001 |
| 575.9106 | 0 |
| 576.13875 | 0.001 |
| 576.36692 | 0 |
| 576.59509 | 0.001 |
| 576.82328 | 0 |
| 577.05148 | 0.001 |
| 577.27969 | 0 |
| 577.50792 | 0.001 |
| 577.73615 | 0 |
| 577.9644 | 0.001 |
| 578.19266 | 0 |
| 578.42093 | 0.001 |
| 578.64921 | 0 |
| 578.87751 | 0.001 |
| 579.10581 | 0 |
| 579.33413 | 0.001 |
| 579.56246 | 0 |
| 579.7908 | 0.001 |
| 580.01916 | 0.001 |
| 580.24752 | 0 |
| 580.4759 | 0.001 |
| 580.70429 | 0 |
| 580.93269 | 0.001 |
| 581.1611 | 0 |
| 581.38952 | 0.001 |
| 581.61796 | 0 |
| 581.84641 | 0.001 |
| 582.07487 | 0 |
| 582.30334 | 0.001 |
| 582.53182 | 0 |
| 582.76032 | 0.001 |
| 582.98882 | 0 |
| 583.21734 | 0.001 |
| 583.44587 | 0 |
| 583.67441 | 0.001 |
| 583.90297 | 0 |
| 584.13153 | 0.001 |
| 584.36011 | 0 |
| 584.58869 | 0.001 |
| 584.81729 | 0 |
| 585.04591 | 0.001 |
| 585.27453 | 0 |
| 585.50317 | 0.001 |
| 585.73181 | 0 |
| 585.96047 | 0.001 |
| 586.18914 | 0 |
| 586.41782 | 0.001 |
| 586.64652 | 0 |
| 586.87522 | 0.001 |
| 587.10394 | 0 |
| 587.33267 | 0.001 |
| 587.56141 | 0 |
| 587.79016 | 0.001 |
| 588.01892 | 0 |
| 588.2477 | 0.001 |
| 588.47648 | 0 |
| 588.70528 | 0.001 |
| 588.93409 | 0 |
| 589.16291 | 0.001 |
| 589.39175 | 0 |
| 589.62059 | 0.001 |
| 589.84945 | 0 |
| 590.07831 | 0.001 |
| 590.30719 | 0 |
| 590.53609 | 0.001 |
| 590.76499 | 0 |
| 590.9939 | 0.001 |
| 591.22283 | 0 |
| 591.45177 | 0.001 |
| 591.68072 | 0 |
| 591.90968 | 0.001 |
| 592.13865 | 0 |
| 592.36763 | 0.001 |
| 592.59663 | 0 |
| 592.82563 | 0.001 |
| 593.05465 | 0 |
| 593.28368 | 0.001 |
| 593.51272 | 0 |
| 593.74178 | 0.001 |
| 593.97084 | 0 |
| 594.19992 | 0.001 |
| 594.42901 | 0 |
| 594.65811 | 0.001 |
| 594.88722 | 0 |
| 595.11634 | 0.001 |
| 595.34547 | 0 |
| 595.57462 | 0.001 |
| 595.80377 | 0 |
| 596.03294 | 0.001 |
| 596.26212 | 0 |
| 596.49131 | 0.001 |
| 596.72052 | 0 |
| 596.94973 | 0.001 |
| 597.17896 | 0 |
| 597.40819 | 0.001 |
| 597.63744 | 0 |
| 597.8667 | 0.001 |
| 598.09597 | 0 |
| 598.32526 | 0.001 |
| 598.55455 | 0 |
| 598.78386 | 0.001 |
| 599.01318 | 0 |
| 599.2425 | 0.001 |
| 599.47185 | 0 |
| 599.7012 | 0.001 |
| 599.93056 | 0 |
| 600.15993 | 0.001 |
| 600.38932 | 0 |
| 600.61872 | 0.001 |
| 600.84813 | 0 |
| 601.07755 | 0.001 |
| 601.30698 | 0 |
| 601.53642 | 0.001 |
| 601.76588 | 0 |
| 601.99534 | 0.001 |
| 602.22482 | 0 |
| 602.45431 | 0.001 |
| 602.68381 | 0 |
| 602.91332 | 0.001 |
| 603.14284 | 0 |
| 603.37238 | 0.001 |
| 603.60192 | 0 |
| 603.83148 | 0.001 |
| 604.06105 | 0 |
| 604.29063 | 0.001 |
| 604.52022 | 0 |
| 604.74982 | 0.001 |
| 604.97944 | 0 |
| 605.20906 | 0.001 |
| 605.4387 | 0 |
| 605.66835 | 0.001 |
| 605.898 | 0 |
| 606.12768 | 0.001 |
| 606.35736 | 0 |
| 606.58705 | 0.001 |
| 606.81675 | 0 |
| 607.04647 | 0.001 |
| 607.2762 | 0 |
| 607.50594 | 0.001 |
| 607.73569 | 0 |
| 607.96545 | 0.001 |
| 608.19522 | 0 |
| 608.425 | 0.001 |
| 608.6548 | 0 |
| 608.8846 | 0.001 |
| 609.11442 | 0 |
| 609.34425 | 0.001 |
| 609.57409 | 0 |
| 609.80394 | 0.001 |
| 610.0338 | 0 |
| 610.26368 | 0.001 |
| 610.49356 | 0 |
| 610.72346 | 0.001 |
| 610.95336 | 0 |
| 611.18328 | 0.001 |
| 611.41321 | 0 |
| 611.64315 | 0.001 |
| 611.87311 | 0 |
| 612.10307 | 0.001 |
| 612.33304 | 0 |
| 612.56303 | 0.001 |
| 612.79303 | 0 |
| 613.02304 | 0.001 |
| 613.25306 | 0 |
| 613.48309 | 0.001 |
| 613.71313 | 0 |
| 613.94318 | 0.001 |
| 614.17325 | 0 |
| 614.40332 | 0.001 |
| 614.63341 | 0 |
| 614.86351 | 0.001 |
| 615.09362 | 0 |
| 615.32374 | 0.001 |
| 615.55387 | 0 |
| 615.78401 | 0.001 |
| 616.01416 | 0 |
| 616.24433 | 0.001 |
| 616.4745 | 0 |
| 616.70469 | 0.001 |
| 616.93489 | 0 |
| 617.1651 | 0.001 |
| 617.39532 | 0 |
| 617.62555 | 0.001 |
| 617.85579 | 0 |
| 618.08605 | 0.001 |
| 618.31631 | 0 |
| 618.54659 | 0.001 |
| 618.77688 | 0 |
| 619.00717 | 0.001 |
| 619.23748 | 0 |
| 619.4678 | 0.001 |
| 619.69814 | 0 |
| 619.92848 | 0.001 |
| 620.15883 | 0 |
| 620.3892 | 0.001 |
| 620.61957 | 0 |
| 620.84996 | 0.001 |
| 621.08036 | 0 |
| 621.31077 | 0.001 |
| 621.54119 | 0 |
| 621.77162 | 0.001 |
| 622.00206 | 0 |
| 622.23252 | 0.001 |
| 622.46298 | 0 |
| 622.69345 | 0.001 |
| 622.92394 | 0 |
| 623.15444 | 0.001 |
| 623.38495 | 0 |
| 623.61547 | 0.001 |
| 623.846 | 0 |
| 624.07654 | 0.001 |
| 624.30709 | 0 |
| 624.53766 | 0.001 |
| 624.76823 | 0 |
| 624.99882 | 0.001 |
| 625.22941 | 0 |
| 625.46002 | 0.001 |
| 625.69064 | 0 |
| 625.92127 | 0.001 |
| 626.15191 | 0 |
| 626.38256 | 0.001 |
| 626.61322 | 0 |
| 626.8439 | 0.001 |
| 627.07458 | 0 |
| 627.30528 | 0.001 |
| 627.53598 | 0 |
| 627.7667 | 0.001 |
| 627.99743 | 0 |
| 628.22817 | 0.001 |
| 628.45892 | 0 |
| 628.68968 | 0.001 |
| 628.92045 | 0 |
| 629.15123 | 0.001 |
| 629.38203 | 0 |
| 629.61283 | 0.001 |
| 629.84365 | 0 |
| 630.07447 | 0.001 |
| 630.30531 | 0 |
| 630.53616 | 0.001 |
| 630.76702 | 0 |
| 630.99789 | 0.001 |
| 631.22877 | 0 |
| 631.45966 | 0.001 |
| 631.69057 | 0 |
| 631.92148 | 0.001 |
| 632.1524 | 0 |
| 632.38334 | 0.001 |
| 632.61429 | 0 |
| 632.84524 | 0.001 |
| 633.07621 | 0 |
| 633.30719 | 0.001 |
| 633.53818 | 0 |
| 633.76918 | 0.001 |
| 634.00019 | 0 |
| 634.23121 | 0.001 |
| 634.46225 | 0 |
| 634.69329 | 0.001 |
| 634.92435 | 0 |
| 635.15541 | 0.001 |
| 635.38649 | 0 |
| 635.61758 | 0.001 |
| 635.84867 | 0 |
| 636.07978 | 0.001 |
| 636.3109 | 0 |
| 636.54203 | 0.001 |
| 636.77317 | 0 |
| 637.00433 | 0.001 |
| 637.23549 | 0 |
| 637.46666 | 0.001 |
| 637.69785 | 0 |
| 637.92904 | 0.001 |
| 638.16025 | 0 |
| 638.39146 | 0.001 |
| 638.62269 | 0 |
| 638.85393 | 0 |
| 639.08518 | 0.001 |
| 639.31644 | 0 |
| 639.54771 | 0.001 |
| 639.77899 | 0 |
| 640.01028 | 0.001 |
| 640.24159 | 0 |
| 640.4729 | 0.001 |
| 640.70422 | 0 |
| 640.93556 | 0.001 |
| 641.1669 | 0 |
| 641.39826 | 0.001 |
| 641.62963 | 0 |
| 641.86101 | 0.001 |
| 642.09239 | 0 |
| 642.32379 | 0.001 |
| 642.5552 | 0 |
| 642.78662 | 0.001 |
| 643.01805 | 0 |
| 643.2495 | 0.001 |
| 643.48095 | 0 |
| 643.71241 | 0.001 |
| 643.94389 | 0 |
| 644.17537 | 0.001 |
| 644.40687 | 0 |
| 644.63837 | 0.001 |
| 644.86989 | 0 |
| 645.10142 | 0.001 |
| 645.33295 | 0 |
| 645.5645 | 0.001 |
| 645.79606 | 0 |
| 646.02763 | 0.001 |
| 646.25921 | 0 |
| 646.4908 | 0.001 |
| 646.7224 | 0 |
| 646.95402 | 0.001 |
| 647.18564 | 0 |
| 647.41727 | 0.001 |
| 647.64892 | 0 |
| 647.88057 | 0.001 |
| 648.11224 | 0 |
| 648.34391 | 0.001 |
| 648.5756 | 0 |
| 648.8073 | 0 |
| 649.03901 | 0 |
| 649.27072 | 0.001 |
| 649.50245 | 0 |
| 649.73419 | 0.001 |
| 649.96594 | 0 |
| 650.1977 | 0.001 |
| 650.42947 | 0 |
| 650.66126 | 0.001 |
| 650.89305 | 0 |
| 651.12485 | 0.001 |
| 651.35666 | 0 |
| 651.58849 | 0.001 |
| 651.82032 | 0 |
| 652.05217 | 0.001 |
| 652.28402 | 0 |
| 652.51589 | 0.001 |
| 652.74776 | 0 |
| 652.97965 | 0.001 |
| 653.21155 | 0 |
| 653.44346 | 0.001 |
| 653.67538 | 0 |
| 653.90731 | 0.001 |
| 654.13924 | 0 |
| 654.37119 | 0.001 |
| 654.60316 | 0 |
| 654.83513 | 0.001 |
| 655.06711 | 0 |
| 655.2991 | 0.001 |
| 655.5311 | 0 |
| 655.76312 | 0.001 |
| 655.99514 | 0 |
| 656.22717 | 0.001 |
| 656.45922 | 0 |
| 656.69127 | 0.001 |
| 656.92334 | 0 |
| 657.15541 | 0 |
| 657.3875 | 0 |
| 657.61959 | 0 |
| 657.8517 | 0 |
| 658.08382 | 0 |
| 658.31595 | 0 |
| 658.54809 | 0 |
| 658.78023 | 0 |
| 659.01239 | 0.001 |
| 659.24456 | -0.001 |
| 659.47674 | 0 |
| 659.70893 | 0 |
| 659.94113 | 0 |
| 660.17334 | 0 |
| 660.40557 | 0 |
| 660.6378 | 0 |
| 660.87004 | 0 |
| 661.10229 | 0 |
| 661.33455 | 0 |
| 661.56683 | 0 |
| 661.79911 | 0 |
| 662.03141 | 0 |
| 662.26371 | 0 |
| 662.49603 | 0 |
| 662.72835 | 0 |
| 662.96069 | 0 |
| 663.19303 | 0 |
| 663.42539 | 0 |
| 663.65775 | 0 |
| 663.89013 | 0 |
| 664.12252 | 0.001 |
| 664.35492 | 0 |
| 664.58732 | 0 |
| 664.81974 | 0 |
| 665.05217 | 0.001 |
| 665.28461 | 0 |
| 665.51706 | 0 |
| 665.74952 | 0 |
| 665.98199 | 0 |
| 666.21447 | 0 |
| 666.44696 | 0 |
| 666.67946 | 0 |
| 666.91197 | 0 |
| 667.14449 | 0 |
| 667.37702 | 0 |
| 667.60956 | -0.001 |
| 667.84211 | 0 |
| 668.07467 | 0 |
| 668.30725 | 0 |
| 668.53983 | 0 |
| 668.77242 | 0 |
| 669.00502 | 0 |
| 669.23764 | 0 |
| 669.47026 | 0 |
| 669.7029 | 0 |
| 669.93554 | 0 |
| 670.16819 | 0 |
| 670.40086 | 0 |
| 670.63353 | 0 |
| 670.86622 | 0 |
| 671.09891 | 0 |
| 671.33162 | 0 |
| 671.56433 | 0 |
| 671.79706 | 0 |
| 672.02979 | 0 |
| 672.26254 | 0 |
| 672.4953 | 0 |
| 672.72806 | 0 |
| 672.96084 | 0 |
| 673.19362 | 0 |
| 673.42642 | 0 |
| 673.65923 | 0 |
| 673.89205 | 0 |
| 674.12487 | -0.001 |
| 674.35771 | 0 |
| 674.59056 | 0 |
| 674.82342 | 0 |
| 675.05628 | 0 |
| 675.28916 | 0 |
| 675.52205 | 0 |
| 675.75495 | 0 |
| 675.98786 | 0 |
| 676.22077 | 0 |
| 676.4537 | 0 |
| 676.68664 | 0 |
| 676.91959 | 0 |
| 677.15255 | 0 |
| 677.38552 | 0 |
| 677.6185 | 0 |
| 677.85149 | 0 |
| 678.08449 | 0 |
| 678.3175 | -0.001 |
| 678.55051 | 0 |
| 678.78354 | 0 |
| 679.01658 | 0 |
| 679.24963 | -0.001 |
| 679.48269 | 0 |
| 679.71576 | 0 |
| 679.94884 | 0 |
| 680.18193 | 0 |
| 680.41503 | 0 |
| 680.64814 | 0 |
| 680.88126 | 0 |
| 681.11439 | 0 |
| 681.34753 | 0 |
| 681.58068 | -0.001 |
| 681.81384 | 0 |
| 682.04701 | -0.001 |
| 682.28019 | 0 |
| 682.51338 | 0 |
| 682.74658 | 0 |
| 682.97979 | 0 |
| 683.21301 | 0 |
| 683.44624 | -0.001 |
| 683.67948 | 0 |
| 683.91273 | -0.001 |
| 684.14599 | 0 |
| 684.37926 | 0 |
| 684.61254 | 0 |
| 684.84583 | 0 |
| 685.07913 | 0 |
| 685.31244 | -0.001 |
| 685.54576 | 0 |
| 685.77909 | -0.001 |
| 686.01243 | 0 |
| 686.24578 | -0.001 |
| 686.47914 | 0 |
| 686.71251 | -0.001 |
| 686.94589 | 0 |
| 687.17928 | -0.001 |
| 687.41268 | 0 |
| 687.64609 | -0.001 |
| 687.87951 | 0 |
| 688.11294 | -0.001 |
| 688.34638 | 0 |
| 688.57982 | -0.001 |
| 688.81328 | 0 |
| 689.04675 | -0.001 |
| 689.28023 | 0 |
| 689.51372 | 0 |
| 689.74722 | 0 |
| 689.98073 | -0.001 |
| 690.21424 | 0 |
| 690.44777 | -0.001 |
| 690.68131 | 0 |
| 690.91486 | -0.001 |
| 691.14842 | 0 |
| 691.38198 | -0.001 |
| 691.61556 | 0 |
| 691.84915 | -0.001 |
| 692.08274 | 0 |
| 692.31635 | -0.001 |
| 692.54997 | 0 |
| 692.78359 | 0 |
| 693.01723 | 0 |
| 693.25088 | -0.001 |
| 693.48453 | 0 |
| 693.7182 | 0 |
| 693.95187 | 0 |
| 694.18556 | -0.001 |
| 694.41925 | 0 |
| 694.65296 | -0.001 |
| 694.88667 | 0 |
| 695.1204 | -0.001 |
| 695.35413 | 0 |
| 695.58788 | -0.001 |
| 695.82163 | 0 |
| 696.0554 | -0.001 |
| 696.28917 | 0 |
| 696.52295 | -0.001 |
| 696.75675 | 0 |
| 696.99055 | -0.001 |
| 697.22436 | 0 |
| 697.45818 | -0.001 |
| 697.69202 | 0 |
| 697.92586 | -0.001 |
| 698.15971 | 0 |
| 698.39357 | 0.001 |
| 698.62744 | -0.001 |
| 698.86132 | 0 |
| 699.09521 | -0.001 |
| 699.32911 | 0 |
| 699.56302 | -0.001 |
| 699.79694 | 0.001 |
| 700.03087 | -0.001 |
| 700.26481 | 0 |
| 700.49876 | -0.001 |
| 700.73272 | 0 |
| 700.96669 | -0.001 |
| 701.20066 | 0 |
| 701.43465 | -0.001 |
| 701.66865 | 0 |
| 701.90266 | -0.001 |
| 702.13667 | 0 |
| 702.3707 | -0.001 |
| 702.60473 | 0 |
| 702.83878 | -0.001 |
| 703.07284 | 0 |
| 703.3069 | -0.001 |
| 703.54097 | 0.001 |
| 703.77506 | -0.001 |
| 704.00915 | 0.001 |
| 704.24326 | -0.001 |
| 704.47737 | 0 |
| 704.71149 | -0.001 |
| 704.94562 | 0 |
| 705.17977 | -0.001 |
| 705.41392 | 0 |
| 705.64808 | -0.001 |
| 705.88225 | 0 |
| 706.11643 | -0.001 |
| 706.35062 | 0 |
| 706.58482 | -0.001 |
| 706.81903 | 0 |
| 707.05325 | -0.001 |
| 707.28748 | 0 |
| 707.52171 | -0.001 |
| 707.75596 | 0 |
| 707.99022 | -0.001 |
| 708.22449 | 0 |
| 708.45876 | -0.001 |
| 708.69305 | 0.001 |
| 708.92734 | -0.001 |
| 709.16165 | 0 |
| 709.39596 | -0.001 |
| 709.63029 | 0 |
| 709.86462 | -0.001 |
| 710.09896 | 0 |
| 710.33332 | -0.001 |
| 710.56768 | 0.001 |
| 710.80205 | -0.001 |
| 711.03643 | 0 |
| 711.27082 | -0.001 |
| 711.50522 | 0 |
| 711.73963 | -0.001 |
| 711.97405 | 0 |
| 712.20848 | -0.001 |
| 712.44292 | 0 |
| 712.67737 | -0.001 |
| 712.91182 | 0.001 |
| 713.14629 | -0.001 |
| 713.38077 | 0 |
| 713.61525 | -0.001 |
| 713.84975 | 0 |
| 714.08425 | -0.001 |
| 714.31876 | 0 |
| 714.55329 | -0.001 |
| 714.78782 | 0 |
| 715.02236 | -0.001 |
| 715.25692 | 0 |
| 715.49148 | -0.001 |
| 715.72605 | 0 |
| 715.96063 | 0 |
| 716.19522 | 0 |
| 716.42982 | -0.001 |
| 716.66443 | 0 |
| 716.89904 | -0.001 |
| 717.13367 | 0 |
| 717.36831 | -0.001 |
| 717.60295 | 0 |
| 717.83761 | -0.001 |
| 718.07227 | 0 |
| 718.30695 | -0.001 |
| 718.54163 | 0 |
| 718.77633 | -0.001 |
| 719.01103 | 0.001 |
| 719.24574 | -0.001 |
| 719.48046 | 0 |
| 719.71519 | -0.001 |
| 719.94993 | 0 |
| 720.18468 | -0.001 |
| 720.41944 | 0 |
| 720.65421 | -0.001 |
| 720.88899 | 0 |
| 721.12377 | -0.001 |
| 721.35857 | 0.001 |
| 721.59337 | -0.001 |
| 721.82819 | 0 |
| 722.06301 | -0.001 |
| 722.29785 | 0 |
| 722.53269 | -0.001 |
| 722.76754 | 0 |
| 723.0024 | -0.001 |
| 723.23727 | 0 |
| 723.47216 | -0.001 |
| 723.70704 | 0 |
| 723.94194 | -0.001 |
| 724.17685 | 0 |
| 724.41177 | -0.001 |
| 724.6467 | 0 |
| 724.88163 | -0.001 |
| 725.11658 | 0 |
| 725.35153 | -0.001 |
| 725.58649 | 0 |
| 725.82147 | 0 |
| 726.05645 | 0 |
| 726.29144 | 0 |
| 726.52644 | 0 |
| 726.76145 | -0.001 |
| 726.99647 | 0 |
| 727.2315 | -0.001 |
| 727.46654 | 0 |
| 727.70158 | -0.001 |
| 727.93664 | 0 |
| 728.17171 | -0.001 |
| 728.40678 | 0 |
| 728.64187 | -0.001 |
| 728.87696 | 0 |
| 729.11206 | -0.001 |
| 729.34717 | 0 |
| 729.58229 | -0.001 |
| 729.81742 | 0 |
| 730.05256 | -0.001 |
| 730.28771 | 0 |
| 730.52287 | -0.001 |
| 730.75804 | 0 |
| 730.99321 | -0.001 |
| 731.2284 | 0 |
| 731.46359 | -0.001 |
| 731.69879 | 0 |
| 731.93401 | -0.001 |
| 732.16923 | 0 |
| 732.40446 | -0.001 |
| 732.6397 | 0 |
| 732.87495 | -0.001 |
| 733.11021 | 0 |
| 733.34547 | -0.001 |
| 733.58075 | 0 |
| 733.81604 | -0.001 |
| 734.05133 | 0 |
| 734.28664 | -0.001 |
| 734.52195 | 0 |
| 734.75727 | -0.001 |
| 734.9926 | 0 |
| 735.22794 | -0.001 |
| 735.46329 | 0 |
| 735.69865 | -0.001 |
| 735.93402 | 0 |
| 736.1694 | 0 |
| 736.40478 | 0 |
| 736.64018 | -0.001 |
| 736.87558 | 0 |
| 737.111 | -0.001 |
| 737.34642 | 0 |
| 737.58185 | -0.001 |
| 737.81729 | 0 |
| 738.05274 | -0.001 |
| 738.2882 | 0 |
| 738.52367 | -0.001 |
| 738.75914 | 0 |
| 738.99463 | -0.001 |
| 739.23012 | 0 |
| 739.46563 | -0.001 |
| 739.70114 | 0 |
| 739.93666 | -0.001 |
| 740.17219 | 0 |
| 740.40773 | -0.001 |
| 740.64328 | 0 |
| 740.87884 | -0.001 |
| 741.11441 | 0 |
| 741.34998 | -0.001 |
| 741.58557 | 0 |
| 741.82116 | -0.001 |
| 742.05676 | 0 |
| 742.29238 | -0.001 |
| 742.528 | 0 |
| 742.76363 | -0.001 |
| 742.99927 | 0 |
| 743.23491 | -0.001 |
| 743.47057 | 0 |
| 743.70624 | -0.001 |
| 743.94191 | 0 |
| 744.1776 | -0.001 |
| 744.41329 | 0 |
| 744.64899 | -0.001 |
| 744.8847 | 0 |
| 745.12042 | -0.001 |
| 745.35615 | 0 |
| 745.59189 | -0.001 |
| 745.82763 | 0 |
| 746.06339 | -0.001 |
| 746.29915 | 0 |
| 746.53493 | -0.001 |
| 746.77071 | 0 |
| 747.0065 | -0.001 |
| 747.2423 | 0 |
| 747.47811 | -0.001 |
| 747.71393 | 0 |
| 747.94975 | -0.001 |
| 748.18559 | 0 |
| 748.42143 | -0.001 |
| 748.65728 | 0 |
| 748.89315 | 0 |
| 749.12902 | 0 |
| 749.3649 | -0.001 |
| 749.60079 | 0 |
| 749.83668 | -0.001 |
| 750.07259 | 0 |
| 750.30851 | -0.001 |
| 750.54443 | 0 |
| 750.78036 | -0.001 |
| 751.0163 | 0 |
| 751.25226 | -0.001 |
| 751.48821 | 0 |
| 751.72418 | -0.001 |
| 751.96016 | 0 |
| 752.19615 | -0.001 |
| 752.43214 | 0 |
| 752.66814 | -0.001 |
| 752.90416 | 0 |
| 753.14018 | -0.001 |
| 753.37621 | 0 |
| 753.61225 | -0.001 |
| 753.8483 | 0 |
| 754.08435 | -0.001 |
| 754.32042 | 0 |
| 754.55649 | -0.001 |
| 754.79257 | 0 |
| 755.02867 | -0.001 |
| 755.26477 | 0 |
| 755.50087 | -0.001 |
| 755.73699 | 0 |
| 755.97312 | -0.001 |
| 756.20925 | 0 |
| 756.4454 | -0.001 |
| 756.68155 | 0 |
| 756.91771 | -0.001 |
| 757.15388 | 0 |
| 757.39006 | -0.001 |
| 757.62625 | 0 |
| 757.86245 | -0.001 |
| 758.09865 | 0 |
| 758.33487 | -0.001 |
| 758.57109 | -0.001 |
| 758.80732 | 0 |
| 759.04356 | -0.001 |
| 759.27981 | 0 |
| 759.51607 | -0.001 |
| 759.75233 | 0 |
| 759.98861 | -0.001 |
| 760.22489 | 0 |
| 760.46118 | -0.001 |
| 760.69748 | 0 |
| 760.93379 | -0.001 |
| 761.17011 | 0 |
| 761.40644 | -0.001 |
| 761.64278 | 0 |
| 761.87912 | -0.001 |
| 762.11547 | 0 |
| 762.35183 | -0.001 |
| 762.5882 | 0 |
| 762.82458 | -0.001 |
| 763.06097 | 0 |
| 763.29737 | -0.001 |
| 763.53377 | 0 |
| 763.77019 | -0.001 |
| 764.00661 | 0 |
| 764.24304 | -0.001 |
| 764.47948 | 0.001 |
| 764.71593 | -0.001 |
| 764.95238 | 0 |
| 765.18885 | -0.001 |
| 765.42532 | 0 |
| 765.6618 | -0.001 |
| 765.89829 | 0 |
| 766.13479 | -0.001 |
| 766.3713 | 0 |
| 766.60782 | -0.001 |
| 766.84434 | 0 |
| 767.08088 | -0.001 |
| 767.31742 | 0 |
| 767.55397 | -0.001 |
| 767.79053 | 0 |
| 768.0271 | -0.001 |
| 768.26367 | 0 |
| 768.50026 | -0.001 |
| 768.73685 | 0.001 |
| 768.97346 | -0.001 |
| 769.21007 | 0 |
| 769.44669 | -0.001 |
| 769.68331 | 0 |
| 769.91995 | -0.001 |
| 770.15659 | 0 |
| 770.39325 | -0.001 |
| 770.62991 | 0 |
| 770.86658 | -0.001 |
| 771.10326 | 0 |
| 771.33995 | -0.001 |
| 771.57664 | 0 |
| 771.81335 | -0.001 |
| 772.05006 | 0 |
| 772.28678 | -0.001 |
| 772.52351 | 0 |
| 772.76025 | -0.001 |
| 772.997 | 0.001 |
| 773.23375 | -0.001 |
| 773.47052 | 0 |
| 773.70729 | -0.001 |
| 773.94407 | 0 |
| 774.18086 | -0.001 |
| 774.41765 | 0 |
| 774.65446 | -0.001 |
| 774.89127 | 0.001 |
| 775.1281 | -0.001 |
| 775.36493 | 0 |
| 775.60177 | -0.001 |
| 775.83862 | 0 |
| 776.07547 | -0.001 |
| 776.31234 | 0.001 |
| 776.54921 | -0.001 |
| 776.78609 | 0 |
| 777.02298 | -0.001 |
| 777.25988 | 0 |
| 777.49679 | -0.001 |
| 777.7337 | 0 |
| 777.97063 | -0.001 |
| 778.20756 | 0.001 |
| 778.4445 | -0.001 |
| 778.68145 | 0.001 |
| 778.91841 | -0.001 |
| 779.15537 | 0.001 |
| 779.39235 | -0.001 |
| 779.62933 | 0 |
| 779.86632 | -0.001 |
| 780.10332 | 0.001 |
| 780.34033 | -0.001 |
| 780.57734 | 0.001 |
| 780.81437 | -0.001 |
| 781.0514 | 0.001 |
| 781.28844 | -0.001 |
| 781.52549 | 0.001 |
| 781.76255 | -0.001 |
| 781.99961 | 0.001 |
| 782.23669 | -0.001 |
| 782.47377 | 0 |
| 782.71086 | -0.001 |
| 782.94796 | 0.001 |
| 783.18507 | -0.001 |
| 783.42218 | 0 |
| 783.6593 | -0.001 |
| 783.89644 | 0.001 |
| 784.13358 | -0.001 |
| 784.37073 | 0 |
| 784.60788 | -0.001 |
| 784.84505 | 0 |
| 785.08222 | -0.001 |
| 785.3194 | 0 |
| 785.55659 | -0.001 |
| 785.79379 | 0.001 |
| 786.031 | -0.001 |
| 786.26821 | 0 |
| 786.50544 | -0.001 |
| 786.74267 | 0 |
| 786.97991 | -0.001 |
| 787.21716 | 0.001 |
| 787.45441 | -0.001 |
| 787.69168 | 0.001 |
| 787.92895 | -0.001 |
| 788.16623 | 0 |
| 788.40352 | -0.001 |
| 788.64081 | 0.001 |
| 788.87812 | -0.001 |
| 789.11543 | 0 |
| 789.35275 | -0.001 |
| 789.59008 | 0 |
| 789.82742 | -0.001 |
| 790.06477 | 0.001 |
| 790.30212 | -0.001 |
| 790.53949 | 0.001 |
| 790.77686 | -0.001 |
| 791.01424 | 0 |
| 791.25162 | -0.001 |
| 791.48902 | 0 |
| 791.72642 | -0.001 |
| 791.96383 | 0.001 |
| 792.20125 | -0.001 |
| 792.43868 | 0 |
| 792.67612 | -0.001 |
| 792.91356 | 0 |
| 793.15101 | -0.001 |
| 793.38847 | 0.001 |
| 793.62594 | -0.001 |
| 793.86342 | 0.001 |
| 794.1009 | -0.001 |
| 794.3384 | 0 |
| 794.5759 | -0.001 |
| 794.81341 | 0.001 |
| 795.05092 | -0.001 |
| 795.28845 | 0.001 |
| 795.52598 | -0.001 |
| 795.76352 | 0 |
| 796.00107 | -0.001 |
| 796.23863 | 0.001 |
| 796.4762 | -0.001 |
| 796.71377 | 0.001 |
| 796.95135 | -0.001 |
| 797.18894 | 0.001 |
| 797.42654 | -0.001 |
| 797.66415 | 0 |
| 797.90176 | -0.001 |
| 798.13938 | 0 |
| 798.37701 | -0.001 |
| 798.61465 | 0.001 |
| 798.8523 | -0.001 |
| 799.08995 | 0.001 |
| 799.32761 | -0.001 |
| 799.56528 | 0.001 |
| 799.80296 | -0.001 |
| 800.04065 | 0 |
| 800.27834 | -0.001 |
| 800.51605 | 0.001 |
| 800.75376 | -0.001 |
| 800.99147 | 0 |
| 801.2292 | -0.001 |
| 801.46694 | 0.001 |
| 801.70468 | -0.001 |
| 801.94243 | 0.001 |
| 802.18019 | -0.001 |
| 802.41795 | 0 |
| 802.65573 | -0.001 |
| 802.89351 | 0.001 |
| 803.1313 | -0.001 |
| 803.3691 | 0 |
| 803.6069 | -0.001 |
| 803.84472 | 0 |
| 804.08254 | -0.001 |
| 804.32037 | 0 |
| 804.55821 | -0.001 |
| 804.79605 | 0.001 |
| 805.03391 | -0.001 |
| 805.27177 | 0.001 |
| 805.50964 | -0.001 |
| 805.74752 | 0 |
| 805.9854 | -0.001 |
| 806.2233 | 0 |
| 806.4612 | -0.001 |
| 806.69911 | 0 |
| 806.93702 | -0.001 |
| 807.17495 | 0 |
| 807.41288 | -0.001 |
| 807.65082 | 0 |
| 807.88877 | -0.001 |
| 808.12673 | 0 |
| 808.36469 | -0.001 |
| 808.60266 | 0.001 |
| 808.84064 | -0.001 |
| 809.07863 | 0 |
| 809.31663 | -0.001 |
| 809.55463 | 0.001 |
| 809.79264 | -0.001 |
| 810.03066 | 0.001 |
| 810.26869 | -0.001 |
| 810.50672 | 0 |
| 810.74477 | -0.001 |
| 810.98282 | 0 |
| 811.22088 | -0.001 |
| 811.45894 | 0 |
| 811.69702 | -0.001 |
| 811.9351 | 0 |
| 812.17319 | -0.001 |
| 812.41129 | 0 |
| 812.64939 | -0.001 |
| 812.88751 | 0.001 |
| 813.12563 | -0.001 |
| 813.36376 | 0.001 |
| 813.60189 | -0.001 |
| 813.84004 | 0.001 |
| 814.07819 | -0.001 |
| 814.31635 | 0.001 |
| 814.55452 | -0.001 |
| 814.79269 | 0.001 |
| 815.03088 | -0.001 |
| 815.26907 | 0.001 |
| 815.50727 | -0.001 |
| 815.74547 | 0 |
| 815.98369 | -0.001 |
| 816.22191 | 0 |
| 816.46014 | -0.001 |
| 816.69838 | 0 |
| 816.93662 | -0.001 |
| 817.17488 | 0 |
| 817.41314 | -0.001 |
| 817.65141 | 0.001 |
| 817.88968 | -0.001 |
| 818.12797 | 0.001 |
| 818.36626 | -0.001 |
| 818.60456 | 0.001 |
| 818.84286 | -0.001 |
| 819.08118 | 0.001 |
| 819.3195 | 0.001 |
| 819.55783 | -0.001 |
| 819.79617 | 0.001 |
| 820.03451 | -0.001 |
| 820.27287 | 0.001 |
| 820.51123 | -0.001 |
| 820.7496 | 0 |
| 820.98797 | -0.001 |
| 821.22636 | 0.001 |
| 821.46475 | -0.001 |
| 821.70315 | 0.001 |
| 821.94155 | -0.001 |
| 822.17997 | 0.001 |
| 822.41839 | -0.001 |
| 822.65682 | 0.001 |
| 822.89526 | -0.001 |
| 823.1337 | 0.001 |
| 823.37216 | -0.001 |
| 823.61062 | 0.001 |
| 823.84908 | -0.001 |
| 824.08756 | 0.001 |
| 824.32604 | -0.001 |
| 824.56453 | 0.001 |
| 824.80303 | -0.001 |
| 825.04154 | 0.001 |
| 825.28005 | -0.001 |
| 825.51857 | 0.001 |
| 825.7571 | -0.001 |
| 825.99564 | 0.001 |
| 826.23418 | -0.001 |
| 826.47273 | 0.001 |
| 826.71129 | -0.001 |
| 826.94986 | 0.001 |
| 827.18843 | -0.001 |
| 827.42701 | 0 |
| 827.6656 | -0.001 |
| 827.9042 | 0.001 |
| 828.1428 | -0.001 |
| 828.38141 | 0 |
| 828.62003 | -0.001 |
| 828.85866 | 0.001 |
| 829.0973 | -0.001 |
| 829.33594 | 0 |
| 829.57459 | -0.001 |
| 829.81324 | 0.001 |
| 830.05191 | -0.001 |
| 830.29058 | 0.001 |
| 830.52926 | -0.001 |
| 830.76795 | 0 |
| 831.00664 | -0.001 |
| 831.24534 | 0 |
| 831.48405 | -0.001 |
| 831.72277 | 0 |
| 831.96149 | -0.001 |
| 832.20023 | 0 |
| 832.43897 | -0.001 |
| 832.67771 | 0 |
| 832.91647 | -0.001 |
| 833.15523 | 0.001 |
| 833.394 | -0.001 |
| 833.63277 | 0.001 |
| 833.87156 | -0.001 |
| 834.11035 | 0.001 |
| 834.34915 | -0.001 |
| 834.58796 | 0 |
| 834.82677 | -0.001 |
| 835.06559 | 0 |
| 835.30442 | -0.001 |
| 835.54326 | 0 |
| 835.7821 | -0.001 |
| 836.02095 | 0.001 |
| 836.25981 | -0.001 |
| 836.49867 | 0.001 |
| 836.73755 | -0.001 |
| 836.97643 | 0.001 |
| 837.21532 | -0.001 |
| 837.45421 | 0.001 |
| 837.69311 | -0.001 |
| 837.93203 | 0.001 |
| 838.17094 | -0.001 |
| 838.40987 | 0 |
| 838.6488 | -0.001 |
| 838.88774 | 0.001 |
| 839.12669 | -0.001 |
| 839.36564 | 0 |
| 839.6046 | -0.001 |
| 839.84357 | 0 |
| 840.08255 | -0.001 |
| 840.32153 | 0.001 |
| 840.56052 | -0.001 |
| 840.79952 | 0.001 |
| 841.03853 | -0.001 |
| 841.27754 | 0 |
| 841.51656 | -0.001 |
| 841.75559 | 0 |
| 841.99462 | -0.001 |
| 842.23367 | 0.001 |
| 842.47272 | -0.001 |
| 842.71177 | 0 |
| 842.95084 | -0.001 |
| 843.18991 | 0 |
| 843.42899 | -0.001 |
| 843.66807 | 0.001 |
| 843.90717 | -0.001 |
| 844.14627 | 0 |
| 844.38538 | -0.001 |
| 844.62449 | 0.001 |
| 844.86361 | -0.001 |
| 845.10274 | 0.001 |
| 845.34188 | -0.001 |
| 845.58102 | 0 |
| 845.82018 | -0.001 |
| 846.05934 | 0.001 |
| 846.2985 | -0.001 |
| 846.53767 | 0.001 |
| 846.77685 | -0.001 |
| 847.01604 | 0.001 |
| 847.25524 | -0.001 |
| 847.49444 | 0.001 |
| 847.73365 | -0.001 |
| 847.97287 | 0 |
| 848.21209 | -0.001 |
| 848.45132 | 0.001 |
| 848.69056 | -0.001 |
| 848.9298 | 0 |
| 849.16906 | -0.001 |
| 849.40832 | 0.001 |
| 849.64758 | -0.001 |
| 849.88686 | 0 |
| 850.12614 | -0.001 |
| 850.36543 | 0.001 |
| 850.60472 | -0.001 |
| 850.84403 | 0 |
| 851.08334 | -0.001 |
| 851.32265 | 0 |
| 851.56198 | -0.001 |
| 851.80131 | 0.001 |
| 852.04065 | -0.001 |
| 852.27999 | 0 |
| 852.51935 | -0.001 |
| 852.75871 | 0.001 |
| 852.99807 | -0.001 |
| 853.23745 | 0.001 |
| 853.47683 | -0.001 |
| 853.71622 | 0.001 |
| 853.95561 | -0.001 |
| 854.19502 | 0.001 |
| 854.43443 | -0.001 |
| 854.67384 | 0 |
| 854.91327 | -0.001 |
| 855.1527 | 0.001 |
| 855.39214 | -0.001 |
| 855.63158 | 0.001 |
| 855.87103 | -0.001 |
| 856.11049 | 0.001 |
| 856.34996 | -0.001 |
| 856.58943 | 0.001 |
| 856.82892 | -0.001 |
| 857.0684 | 0.001 |
| 857.3079 | -0.001 |
| 857.5474 | 0.001 |
| 857.78691 | -0.001 |
| 858.02642 | 0.001 |
| 858.26595 | -0.001 |
| 858.50548 | 0.001 |
| 858.74502 | -0.001 |
| 858.98456 | 0.001 |
| 859.22411 | -0.001 |
| 859.46367 | 0.001 |
| 859.70323 | -0.001 |
| 859.94281 | 0.001 |
| 860.18239 | -0.001 |
| 860.42197 | 0.001 |
| 860.66156 | -0.001 |
| 860.90116 | 0.001 |
| 861.14077 | -0.001 |
| 861.38039 | 0.001 |
| 861.62001 | -0.001 |
| 861.85964 | 0 |
| 862.09927 | -0.001 |
| 862.33891 | 0.001 |
| 862.57856 | -0.001 |
| 862.81822 | 0.001 |
| 863.05788 | -0.001 |
| 863.29755 | 0.001 |
| 863.53723 | -0.001 |
| 863.77691 | 0.001 |
| 864.0166 | -0.001 |
| 864.2563 | 0.001 |
| 864.49601 | -0.001 |
| 864.73572 | 0.001 |
| 864.97544 | -0.001 |
| 865.21516 | 0.001 |
| 865.45489 | -0.001 |
| 865.69463 | 0.001 |
| 865.93438 | -0.001 |
| 866.17413 | 0.001 |
| 866.41389 | -0.001 |
| 866.65366 | 0.001 |
| 866.89343 | -0.001 |
| 867.13321 | 0.001 |
| 867.373 | -0.001 |
| 867.6128 | 0.001 |
| 867.8526 | -0.001 |
| 868.09241 | 0.001 |
| 868.33222 | -0.001 |
| 868.57204 | 0.001 |
| 868.81187 | -0.001 |
| 869.05171 | 0.001 |
| 869.29155 | -0.001 |
| 869.5314 | 0.001 |
| 869.77126 | -0.001 |
| 870.01112 | 0.001 |
| 870.25099 | -0.001 |
| 870.49087 | 0.001 |
| 870.73075 | -0.001 |
| 870.97064 | 0.001 |
| 871.21054 | -0.001 |
| 871.45044 | 0.001 |
| 871.69035 | -0.001 |
| 871.93027 | 0.001 |
| 872.1702 | -0.001 |
| 872.41013 | 0.001 |
| 872.65007 | -0.001 |
| 872.89001 | 0.001 |
| 873.12996 | -0.001 |
| 873.36992 | 0.001 |
| 873.60989 | -0.001 |
| 873.84986 | 0.001 |
| 874.08984 | -0.001 |
| 874.32982 | 0.001 |
| 874.56982 | -0.002 |
| 874.80982 | 0.001 |
| 875.04982 | -0.001 |
| 875.28983 | 0.001 |
| 875.52985 | -0.002 |
| 875.76988 | 0.001 |
| 876.00991 | -0.002 |
| 876.24995 | 0.001 |
| 876.49 | -0.001 |
| 876.73005 | 0.001 |
| 876.97011 | -0.001 |
| 877.21018 | 0.001 |
| 877.45025 | -0.001 |
| 877.69033 | 0.001 |
| 877.93042 | -0.002 |
| 878.17051 | 0.001 |
| 878.41061 | -0.002 |
| 878.65072 | 0.001 |
| 878.89084 | -0.002 |
| 879.13096 | 0.001 |
| 879.37108 | -0.002 |
| 879.61122 | 0.001 |
| 879.85136 | -0.002 |
| 880.0915 | 0.001 |
| 880.33166 | -0.002 |
| 880.57182 | -0.001 |
| 880.81199 | 0.001 |
| 881.05216 | -0.002 |
| 881.29234 | 0.001 |
| 881.53253 | -0.002 |
| 881.77272 | 0.001 |
| 882.01292 | -0.002 |
| 882.25313 | 0.001 |
| 882.49334 | -0.002 |
| 882.73356 | 0 |
| 882.97379 | -0.002 |
| 883.21402 | 0.001 |
| 883.45426 | -0.002 |
| 883.69451 | 0.001 |
| 883.93476 | -0.002 |
| 884.17502 | 0.001 |
| 884.41529 | -0.002 |
| 884.65556 | 0.001 |
| 884.89584 | -0.002 |
| 885.13613 | 0.001 |
| 885.37642 | -0.002 |
| 885.61672 | 0.001 |
| 885.85703 | -0.002 |
| 886.09734 | 0.001 |
| 886.33766 | -0.002 |
| 886.57799 | 0.001 |
| 886.81832 | -0.002 |
| 887.05866 | 0.001 |
| 887.29901 | -0.002 |
| 887.53936 | 0.001 |
| 887.77972 | -0.002 |
| 888.02008 | 0.001 |
| 888.26045 | -0.002 |
| 888.50083 | 0.001 |
| 888.74122 | -0.002 |
| 888.98161 | 0.001 |
| 889.22201 | -0.002 |
| 889.46241 | 0.001 |
| 889.70282 | -0.002 |
| 889.94324 | 0.001 |
| 890.18366 | -0.002 |
| 890.42409 | 0.001 |
| 890.66453 | -0.002 |
| 890.90497 | 0.001 |
| 891.14542 | -0.002 |
| 891.38588 | 0.001 |
| 891.62634 | -0.002 |
| 891.86681 | 0.001 |
| 892.10729 | -0.002 |
| 892.34777 | 0.001 |
| 892.58826 | -0.002 |
| 892.82876 | 0.001 |
| 893.06926 | -0.002 |
| 893.30977 | 0.001 |
| 893.55028 | -0.002 |
| 893.7908 | 0.001 |
| 894.03133 | -0.002 |
| 894.27186 | 0.001 |
| 894.51241 | -0.002 |
| 894.75295 | 0.001 |
| 894.99351 | -0.002 |
| 895.23407 | 0.001 |
| 895.47463 | -0.002 |
| 895.7152 | 0.001 |
| 895.95578 | -0.002 |
| 896.19637 | 0.001 |
| 896.43696 | -0.002 |
| 896.67756 | 0.001 |
| 896.91816 | -0.002 |
| 897.15878 | 0.001 |
| 897.39939 | -0.002 |
| 897.64002 | 0.001 |
| 897.88065 | -0.002 |
| 898.12128 | 0.001 |
| 898.36193 | -0.002 |
| 898.60258 | 0.001 |
| 898.84323 | -0.002 |
| 899.08389 | 0.001 |
| 899.32456 | -0.002 |
| 899.56524 | 0.001 |
| 899.80592 | -0.002 |
| 900.04661 | 0.001 |
| 900.2873 | -0.002 |
| 900.528 | 0.001 |
| 900.76871 | -0.002 |
| 901.00942 | 0.001 |
| 901.25014 | -0.002 |
| 901.49087 | 0.001 |
| 901.7316 | -0.002 |
| 901.97234 | 0.001 |
| 902.21308 | -0.002 |
| 902.45383 | 0.001 |
| 902.69459 | -0.002 |
| 902.93535 | 0.001 |
| 903.17612 | -0.003 |
| 903.4169 | 0.001 |
| 903.65768 | -0.002 |
| 903.89847 | 0.001 |
| 904.13926 | -0.002 |
| 904.38006 | 0.001 |
| 904.62087 | -0.002 |
| 904.86169 | 0.001 |
| 905.10251 | -0.003 |
| 905.34333 | 0.001 |
| 905.58416 | -0.002 |
| 905.825 | 0.001 |
| 906.06585 | -0.002 |
| 906.3067 | 0.001 |
| 906.54756 | -0.002 |
| 906.78842 | 0.001 |
| 907.02929 | -0.002 |
| 907.27017 | 0.002 |
| 907.51105 | -0.002 |
| 907.75194 | 0.001 |
| 907.99283 | -0.003 |
| 908.23373 | 0.001 |
| 908.47464 | -0.002 |
| 908.71555 | 0.001 |
| 908.95647 | -0.003 |
| 909.1974 | 0.001 |
| 909.43833 | -0.002 |
| 909.67927 | 0.002 |
| 909.92021 | -0.003 |
| 910.16116 | 0.001 |
| 910.40212 | -0.002 |
| 910.64308 | 0.001 |
| 910.88405 | -0.002 |
| 911.12503 | 0.001 |
| 911.36601 | -0.002 |
| 911.607 | 0.001 |
| 911.84799 | -0.002 |
| 912.08899 | 0.001 |
| 912.33 | -0.002 |
| 912.57101 | 0.002 |
| 912.81203 | -0.003 |
| 913.05305 | 0.001 |
| 913.29408 | -0.003 |
| 913.53512 | 0.001 |
| 913.77616 | -0.002 |
| 914.01721 | 0.002 |
| 914.25827 | -0.002 |
| 914.49933 | 0.001 |
| 914.74039 | -0.003 |
| 914.98147 | 0.001 |
| 915.22255 | -0.002 |
| 915.46363 | 0.001 |
| 915.70472 | -0.003 |
| 915.94582 | 0.001 |
| 916.18693 | -0.003 |
| 916.42804 | 0.001 |
| 916.66915 | -0.002 |
| 916.91027 | 0.001 |
| 917.1514 | -0.002 |
| 917.39254 | 0.002 |
| 917.63368 | -0.003 |
| 917.87482 | 0.001 |
| 918.11597 | -0.003 |
| 918.35713 | 0.002 |
| 918.5983 | -0.003 |
| 918.83947 | 0.001 |
| 919.08064 | -0.002 |
| 919.32183 | 0.001 |
| 919.56301 | -0.003 |
| 919.80421 | 0.001 |
| 920.04541 | -0.002 |
| 920.28662 | 0.001 |
| 920.52783 | -0.003 |
| 920.76905 | 0.001 |
| 921.01027 | -0.003 |
| 921.2515 | 0.002 |
| 921.49274 | -0.003 |
| 921.73398 | 0.002 |
| 921.97523 | -0.002 |
| 922.21648 | 0.001 |
| 922.45774 | -0.003 |
| 922.69901 | 0.001 |
| 922.94028 | -0.003 |
| 923.18156 | 0.002 |
| 923.42285 | -0.003 |
| 923.66414 | 0.001 |
| 923.90543 | -0.003 |
| 924.14673 | 0.002 |
| 924.38804 | -0.003 |
| 924.62936 | 0.001 |
| 924.87068 | -0.002 |
| 925.112 | 0.001 |
| 925.35333 | -0.002 |
| 925.59467 | 0.002 |
| 925.83602 | -0.003 |
| 926.07737 | 0.002 |
| 926.31872 | -0.002 |
| 926.56008 | 0.001 |
| 926.80145 | -0.003 |
| 927.04282 | 0.002 |
| 927.2842 | -0.002 |
| 927.52559 | 0.002 |
| 927.76698 | -0.002 |
| 928.00837 | 0.001 |
| 928.24978 | -0.002 |
| 928.49119 | 0.002 |
| 928.7326 | -0.003 |
| 928.97402 | 0.001 |
| 929.21545 | -0.003 |
| 929.45688 | 0.002 |
| 929.69832 | -0.002 |
| 929.93976 | 0.001 |
| 930.18121 | -0.003 |
| 930.42267 | 0.002 |
| 930.66413 | -0.002 |
| 930.90559 | 0.002 |
| 931.14707 | -0.003 |
| 931.38855 | 0.002 |
| 931.63003 | -0.003 |
| 931.87152 | 0.002 |
| 932.11302 | -0.003 |
| 932.35452 | 0.001 |
| 932.59603 | -0.003 |
| 932.83754 | 0.002 |
| 933.07906 | -0.003 |
| 933.32059 | 0.002 |
| 933.56212 | -0.003 |
| 933.80365 | 0.001 |
| 934.0452 | -0.003 |
| 934.28674 | 0.002 |
| 934.5283 | -0.002 |
| 934.76986 | 0.002 |
| 935.01142 | -0.003 |
| 935.253 | 0.001 |
| 935.49457 | -0.003 |
| 935.73616 | 0.002 |
| 935.97774 | -0.003 |
| 936.21934 | 0.002 |
| 936.46094 | -0.003 |
| 936.70254 | 0.002 |
| 936.94416 | -0.004 |
| 937.18577 | 0.002 |
| 937.4274 | -0.004 |
| 937.66903 | 0.001 |
| 937.91066 | -0.004 |
| 938.1523 | 0.002 |
| 938.39395 | -0.004 |
| 938.6356 | 0.002 |
| 938.87726 | -0.003 |
| 939.11892 | 0.001 |
| 939.36059 | -0.004 |
| 939.60226 | 0.002 |
| 939.84394 | -0.004 |
| 940.08563 | 0.002 |
| 940.32732 | -0.004 |
| 940.56902 | 0.002 |
| 940.81072 | -0.004 |
| 941.05243 | 0.002 |
| 941.29414 | -0.004 |
| 941.53586 | 0.001 |
| 941.77759 | -0.004 |
| 942.01932 | 0.002 |
| 942.26106 | 0.001 |
| 942.5028 | -0.004 |
| 942.74455 | 0.002 |
| 942.9863 | -0.003 |
| 943.22806 | 0.002 |
| 943.46983 | -0.004 |
| 943.7116 | 0.003 |
| 943.95337 | -0.004 |
| 944.19516 | 0.002 |
| 944.43694 | -0.004 |
| 944.67874 | 0.002 |
| 944.92054 | -0.004 |
| 945.16234 | 0.002 |
| 945.40415 | -0.003 |
| 945.64596 | 0.003 |
| 945.88779 | -0.004 |
| 946.12961 | 0.002 |
| 946.37145 | -0.004 |
| 946.61328 | 0.002 |
| 946.85513 | -0.004 |
| 947.09698 | 0.002 |
| 947.33883 | -0.003 |
| 947.58069 | 0.002 |
| 947.82256 | -0.004 |
| 948.06443 | 0.002 |
| 948.3063 | -0.003 |
| 948.54819 | 0.002 |
| 948.79007 | -0.004 |
| 949.03197 | 0.002 |
| 949.27387 | -0.005 |
| 949.51577 | 0.001 |
| 949.75768 | -0.004 |
| 949.9996 | 0.001 |
| 950.24152 | -0.004 |
| 950.48344 | 0.002 |
| 950.72538 | -0.004 |
| 950.96731 | 0.003 |
| 951.20926 | -0.004 |
| 951.45121 | 0.002 |
| 951.69316 | -0.003 |
| 951.93512 | 0.003 |
| 952.17708 | -0.004 |
| 952.41906 | 0.002 |
| 952.66103 | -0.004 |
| 952.90301 | 0.003 |
| 953.145 | -0.003 |
| 953.38699 | 0.002 |
| 953.62899 | -0.005 |
| 953.87099 | 0.001 |
| 954.113 | -0.004 |
| 954.35502 | 0.002 |
| 954.59704 | -0.004 |
| 954.83906 | 0.003 |
| 955.08109 | -0.004 |
| 955.32313 | 0.002 |
| 955.56517 | -0.003 |
| 955.80722 | 0.002 |
| 956.04927 | -0.005 |
| 956.29133 | 0.003 |
| 956.53339 | -0.003 |
| 956.77546 | 0.003 |
| 957.01753 | -0.003 |
| 957.25961 | 0.002 |
| 957.5017 | -0.003 |
| 957.74379 | 0.002 |
| 957.98588 | -0.004 |
| 958.22798 | 0.001 |
| 958.47009 | -0.004 |
| 958.7122 | 0.002 |
| 958.95432 | -0.003 |
| 959.19644 | 0.002 |
| 959.43857 | -0.003 |
| 959.6807 | 0.003 |
| 959.92284 | -0.004 |
| 960.16498 | 0.002 |
| 960.40713 | -0.004 |
| 960.64929 | 0.002 |
| 960.89145 | -0.004 |
| 961.13361 | 0.002 |
| 961.37578 | -0.004 |
| 961.61796 | 0.002 |
| 961.86014 | -0.004 |
| 962.10233 | 0.002 |
| 962.34452 | -0.004 |
| 962.58671 | 0.002 |
| 962.82892 | -0.004 |
| 963.07112 | 0.001 |
| 963.31334 | -0.004 |
| 963.55556 | 0.002 |
| 963.79778 | -0.004 |
| 964.04001 | 0.001 |
| 964.28224 | -0.004 |
| 964.52448 | 0.002 |
| 964.76673 | -0.004 |
| 965.00898 | 0.001 |
| 965.25123 | -0.004 |
| 965.49349 | 0.002 |
| 965.73576 | -0.004 |
| 965.97803 | 0.002 |
| 966.22031 | -0.004 |
| 966.46259 | 0.002 |
| 966.70488 | -0.004 |
| 966.94717 | 0.002 |
| 967.18946 | -0.004 |
| 967.43177 | 0.003 |
| 967.67408 | -0.004 |
| 967.91639 | 0.001 |
| 968.15871 | -0.004 |
| 968.40103 | 0.003 |
| 968.64336 | -0.005 |
| 968.88569 | 0.002 |
| 969.12803 | -0.004 |
| 969.37038 | 0.002 |
| 969.61273 | -0.003 |
| 969.85508 | 0.002 |
| 970.09744 | -0.004 |
| 970.3398 | 0.002 |
| 970.58218 | -0.004 |
| 970.82455 | 0.002 |
| 971.06693 | -0.005 |
| 971.30932 | 0.002 |
| 971.55171 | -0.004 |
| 971.7941 | 0.003 |
| 972.03651 | -0.005 |
| 972.27891 | 0.002 |
| 972.52132 | -0.005 |
| 972.76374 | 0.003 |
| 973.00616 | -0.004 |
| 973.24859 | 0.002 |
| 973.49102 | -0.005 |
| 973.73346 | 0.003 |
| 973.9759 | -0.004 |
| 974.21835 | 0.002 |
| 974.4608 | -0.004 |
| 974.70326 | 0.002 |
| 974.94572 | -0.004 |
| 975.18819 | 0.002 |
| 975.43066 | -0.004 |
| 975.67314 | 0.002 |
| 975.91562 | -0.004 |
| 976.15811 | 0.001 |
| 976.40061 | -0.004 |
| 976.6431 | 0.002 |
| 976.88561 | -0.006 |
| 977.12812 | 0.003 |
| 977.37063 | -0.005 |
| 977.61315 | 0.003 |
| 977.85567 | -0.005 |
| 978.0982 | 0.002 |
| 978.34074 | -0.004 |
| 978.58327 | 0.002 |
| 978.82582 | -0.005 |
| 979.06837 | 0.002 |
| 979.31092 | -0.004 |
| 979.55348 | 0.003 |
| 979.79604 | -0.004 |
| 980.03861 | 0.002 |
| 980.28119 | -0.006 |
| 980.52377 | 0.003 |
| 980.76635 | -0.004 |
| 981.00894 | 0.003 |
| 981.25154 | -0.005 |
| 981.49413 | 0.002 |
| 981.73674 | -0.005 |
| 981.97935 | 0.003 |
| 982.22196 | -0.005 |
| 982.46458 | 0.003 |
| 982.70721 | -0.005 |
| 982.94983 | 0.003 |
| 983.19247 | -0.005 |
| 983.43511 | 0.003 |
| 983.67775 | -0.004 |
| 983.9204 | 0.003 |
| 984.16306 | -0.004 |
| 984.40571 | 0.002 |
| 984.64838 | -0.005 |
| 984.89105 | 0.003 |
| 985.13372 | -0.005 |
| 985.3764 | 0.003 |
| 985.61908 | -0.005 |
| 985.86177 | 0.003 |
| 986.10447 | -0.005 |
| 986.34716 | 0.002 |
| 986.58987 | -0.005 |
| 986.83258 | 0.002 |
| 987.07529 | -0.005 |
| 987.31801 | 0.002 |
| 987.56073 | -0.005 |
| 987.80346 | 0.002 |
| 988.04619 | -0.005 |
| 988.28893 | 0.003 |
| 988.53167 | -0.006 |
| 988.77442 | 0.003 |
| 989.01717 | -0.006 |
| 989.25993 | 0.002 |
| 989.50269 | -0.006 |
| 989.74546 | 0.004 |
| 989.98823 | -0.007 |
| 990.23101 | 0.002 |
| 990.47379 | -0.006 |
| 990.71657 | 0.003 |
| 990.95937 | -0.006 |
| 991.20216 | 0.004 |
| 991.44496 | -0.006 |
| 991.68777 | 0.003 |
| 991.93058 | -0.006 |
| 992.17339 | 0.003 |
| 992.41621 | -0.005 |
| 992.65904 | 0.003 |
| 992.90187 | -0.006 |
| 993.1447 | 0.003 |
| 993.38754 | -0.006 |
| 993.63039 | 0.002 |
| 993.87324 | -0.005 |
| 994.11609 | 0.003 |
| 994.35895 | -0.006 |
| 994.60181 | 0.003 |
| 994.84468 | -0.006 |
| 995.08755 | 0.004 |
| 995.33043 | -0.006 |
| 995.57331 | 0.004 |
| 995.8162 | -0.007 |
| 996.05909 | 0.004 |
| 996.30199 | -0.007 |
| 996.54489 | 0.004 |
| 996.7878 | -0.006 |
| 997.03071 | 0.004 |
| 997.27363 | -0.007 |
| 997.51655 | 0.003 |
| 997.75947 | -0.006 |
| 998.0024 | 0.004 |
| 998.24534 | -0.007 |
| 998.48828 | 0.004 |
| 998.73122 | -0.008 |
| 998.97417 | 0.004 |
| 999.21712 | -0.008 |
| 999.46008 | 0.005 |
| 999.70304 | -0.006 |
| 999.94601 | 0.003 |
| 1000.18898 | -0.008 |
| 1000.43196 | 0.004 |
| 1000.67494 | -0.008 |
| 1000.91793 | 0.004 |
| 1001.16092 | -0.006 |
| 1001.40392 | 0.004 |
| 1001.64692 | -0.006 |
| 1001.88992 | 0.004 |
| 1002.13293 | -0.007 |
| 1002.37595 | 0.003 |
| 1002.61897 | -0.008 |
| 1002.86199 | 0.002 |
| 1003.10502 | -0.008 |
| 1003.34805 | 0.006 |
| 1003.59109 | -0.007 |
| 1003.83413 | 0.004 |
| 1004.07718 | -0.009 |
| 1004.32023 | -0.008 |
| 1004.56329 | 0.003 |
| 1004.80635 | -0.007 |
| 1005.04941 | 0.004 |
| 1005.29248 | -0.009 |
| 1005.53556 | 0.003 |
| 1005.77864 | -0.009 |
| 1006.02172 | 0.004 |
| 1006.26481 | -0.007 |
| 1006.5079 | 0.005 |
| 1006.751 | -0.008 |
| 1006.9941 | 0.002 |
| 1007.23721 | -0.01 |
| 1007.48032 | 0.004 |
| 1007.72344 | -0.009 |
| 1007.96656 | 0.005 |
| 1008.20968 | -0.008 |
| 1008.45281 | 0.004 |
| 1008.69595 | -0.008 |
| 1008.93909 | 0.005 |
| 1009.18223 | -0.01 |
| 1009.42538 | 0.006 |
| 1009.66853 | -0.012 |
| 1009.91169 | 0.005 |
| 1010.15485 | -0.009 |
| 1010.39801 | 0.004 |
| 1010.64118 | -0.01 |
| 1010.88436 | 0.005 |
| 1011.12754 | -0.008 |
| 1011.37072 | 0.006 |
| 1011.61391 | -0.011 |
| 1011.8571 | 0.007 |
| 1012.1003 | -0.011 |
| 1012.3435 | 0.006 |
| 1012.58671 | -0.01 |
| 1012.82992 | 0.006 |
| 1013.07314 | -0.011 |
| 1013.31636 | 0.004 |
| 1013.55958 | -0.013 |
| 1013.80281 | 0.006 |
| 1014.04604 | -0.01 |
| 1014.28928 | 0.003 |
| 1014.53252 | -0.01 |
| 1014.77577 | 0.009 |
| 1015.01902 | -0.013 |
| 1015.26228 | 0.005 |
| 1015.50554 | -0.01 |
| 1015.7488 | 0.003 |
| 1015.99207 | -0.012 |
| 1016.23535 | 0.005 |
| 1016.47862 | -0.011 |
| 1016.72191 | 0.008 |
| 1016.96519 | -0.011 |
| 1017.20848 | 0.007 |
| 1017.45178 | -0.013 |
| 1017.69508 | 0.006 |
| 1017.93838 | -0.015 |
| 1018.18169 | 0.007 |
| 1018.425 | -0.011 |
| 1018.66832 | 0.009 |
| 1018.91164 | -0.012 |
| 1019.15497 | 0.011 |
| 1019.3983 | -0.013 |
| 1019.64164 | 0.006 |
| 1019.88498 | -0.013 |
| 1020.12832 | 0.005 |
| 1020.37167 | -0.013 |
| 1020.61502 | 0.008 |
| 1020.85838 | -0.012 |
| 1021.10174 | 0.005 |
| 1021.3451 | -0.013 |
| 1021.58847 | 0.006 |
| 1021.83185 | 0 |
| 1022.07523 | 0 |
| 1022.31861 | 0 |
| 1022.562 | 0 |
| 1022.80539 | 0 |
| 1023.04878 | 0 |
| 1023.29218 | 0 |
| 1023.53559 | 0 |
| 1023.779 | 0 |
| 1024.02241 | 0 |
| 1024.26583 | 0 |
| 1024.50925 | 0 |
| 1024.75268 | 0 |
| 1024.99611 | 0 |
| 1025.23954 | 0 |
| 1025.48298 | 0 |
| 1025.72642 | 0 |
| 1025.96987 | 0 |
| 1026.21332 | 0 |
| 1026.45678 | 0 |
| 1026.70024 | 0 |
| 1026.9437 | 0 |
| 1027.18717 | 0 |
| 1027.43064 | 0 |